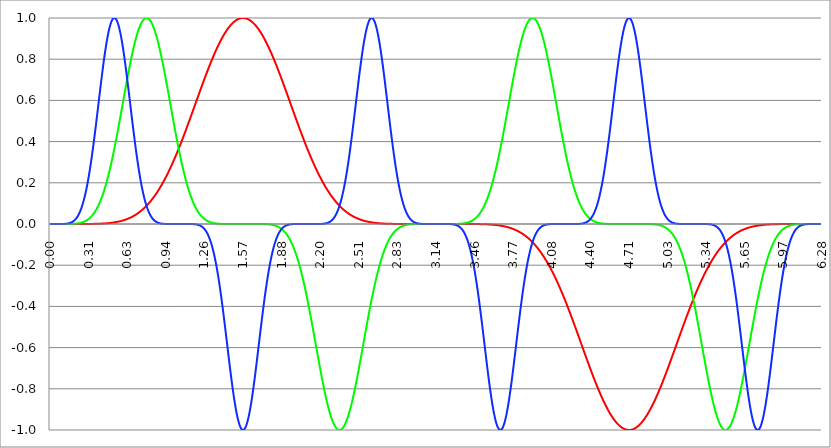
| Category | Series 1 | Series 0 | Series 2 |
|---|---|---|---|
| 0.0 | 0 | 0 | 0 |
| 0.00314159265358979 | 0 | 0 | 0 |
| 0.00628318530717958 | 0 | 0 | 0 |
| 0.00942477796076938 | 0 | 0 | 0 |
| 0.0125663706143592 | 0 | 0 | 0 |
| 0.015707963267949 | 0 | 0 | 0 |
| 0.0188495559215388 | 0 | 0 | 0 |
| 0.0219911485751285 | 0 | 0 | 0 |
| 0.0251327412287183 | 0 | 0 | 0 |
| 0.0282743338823081 | 0 | 0 | 0 |
| 0.0314159265358979 | 0 | 0 | 0 |
| 0.0345575191894877 | 0 | 0 | 0 |
| 0.0376991118430775 | 0 | 0 | 0 |
| 0.0408407044966673 | 0 | 0 | 0 |
| 0.0439822971502571 | 0 | 0 | 0 |
| 0.0471238898038469 | 0 | 0 | 0 |
| 0.0502654824574367 | 0 | 0 | 0 |
| 0.0534070751110265 | 0 | 0 | 0 |
| 0.0565486677646163 | 0 | 0 | 0 |
| 0.059690260418206 | 0 | 0 | 0 |
| 0.0628318530717958 | 0 | 0 | 0 |
| 0.0659734457253856 | 0 | 0 | 0 |
| 0.0691150383789754 | 0 | 0 | 0 |
| 0.0722566310325652 | 0 | 0 | 0 |
| 0.075398223686155 | 0 | 0 | 0 |
| 0.0785398163397448 | 0 | 0 | 0 |
| 0.0816814089933346 | 0 | 0 | 0 |
| 0.0848230016469244 | 0 | 0 | 0 |
| 0.0879645943005142 | 0 | 0 | 0 |
| 0.091106186954104 | 0 | 0 | 0 |
| 0.0942477796076937 | 0 | 0 | 0 |
| 0.0973893722612835 | 0 | 0 | 0 |
| 0.100530964914873 | 0 | 0 | 0 |
| 0.103672557568463 | 0 | 0 | 0 |
| 0.106814150222053 | 0 | 0 | 0 |
| 0.109955742875643 | 0 | 0 | 0 |
| 0.113097335529233 | 0 | 0 | 0 |
| 0.116238928182822 | 0 | 0 | 0.001 |
| 0.119380520836412 | 0 | 0 | 0.001 |
| 0.122522113490002 | 0 | 0 | 0.001 |
| 0.125663706143592 | 0 | 0 | 0.001 |
| 0.128805298797181 | 0 | 0 | 0.001 |
| 0.131946891450771 | 0 | 0 | 0.001 |
| 0.135088484104361 | 0 | 0 | 0.001 |
| 0.138230076757951 | 0 | 0 | 0.002 |
| 0.141371669411541 | 0 | 0 | 0.002 |
| 0.14451326206513 | 0 | 0 | 0.002 |
| 0.14765485471872 | 0 | 0 | 0.003 |
| 0.15079644737231 | 0 | 0 | 0.003 |
| 0.1539380400259 | 0 | 0 | 0.003 |
| 0.15707963267949 | 0 | 0 | 0.004 |
| 0.160221225333079 | 0 | 0 | 0.005 |
| 0.163362817986669 | 0 | 0 | 0.005 |
| 0.166504410640259 | 0 | 0 | 0.006 |
| 0.169646003293849 | 0 | 0 | 0.007 |
| 0.172787595947439 | 0 | 0.001 | 0.007 |
| 0.175929188601028 | 0 | 0.001 | 0.008 |
| 0.179070781254618 | 0 | 0.001 | 0.009 |
| 0.182212373908208 | 0 | 0.001 | 0.01 |
| 0.185353966561798 | 0 | 0.001 | 0.011 |
| 0.188495559215388 | 0 | 0.001 | 0.013 |
| 0.191637151868977 | 0 | 0.001 | 0.014 |
| 0.194778744522567 | 0 | 0.001 | 0.016 |
| 0.197920337176157 | 0 | 0.001 | 0.017 |
| 0.201061929829747 | 0 | 0.001 | 0.019 |
| 0.204203522483336 | 0 | 0.002 | 0.021 |
| 0.207345115136926 | 0 | 0.002 | 0.023 |
| 0.210486707790516 | 0 | 0.002 | 0.025 |
| 0.213628300444106 | 0 | 0.002 | 0.027 |
| 0.216769893097696 | 0 | 0.002 | 0.03 |
| 0.219911485751285 | 0 | 0.003 | 0.032 |
| 0.223053078404875 | 0 | 0.003 | 0.035 |
| 0.226194671058465 | 0 | 0.003 | 0.038 |
| 0.229336263712055 | 0 | 0.003 | 0.042 |
| 0.232477856365645 | 0 | 0.004 | 0.045 |
| 0.235619449019234 | 0 | 0.004 | 0.049 |
| 0.238761041672824 | 0 | 0.004 | 0.053 |
| 0.241902634326414 | 0 | 0.005 | 0.057 |
| 0.245044226980004 | 0 | 0.005 | 0.061 |
| 0.248185819633594 | 0 | 0.006 | 0.066 |
| 0.251327412287183 | 0 | 0.006 | 0.07 |
| 0.254469004940773 | 0 | 0.007 | 0.076 |
| 0.257610597594363 | 0 | 0.007 | 0.081 |
| 0.260752190247953 | 0 | 0.008 | 0.086 |
| 0.263893782901543 | 0 | 0.008 | 0.092 |
| 0.267035375555132 | 0 | 0.009 | 0.098 |
| 0.270176968208722 | 0 | 0.01 | 0.105 |
| 0.273318560862312 | 0 | 0.01 | 0.112 |
| 0.276460153515902 | 0 | 0.011 | 0.119 |
| 0.279601746169492 | 0 | 0.012 | 0.126 |
| 0.282743338823082 | 0 | 0.013 | 0.134 |
| 0.285884931476671 | 0 | 0.014 | 0.142 |
| 0.289026524130261 | 0 | 0.015 | 0.15 |
| 0.292168116783851 | 0 | 0.016 | 0.158 |
| 0.295309709437441 | 0 | 0.017 | 0.167 |
| 0.298451302091031 | 0 | 0.018 | 0.176 |
| 0.30159289474462 | 0 | 0.019 | 0.186 |
| 0.30473448739821 | 0 | 0.02 | 0.196 |
| 0.3078760800518 | 0 | 0.021 | 0.206 |
| 0.31101767270539 | 0 | 0.023 | 0.216 |
| 0.31415926535898 | 0 | 0.024 | 0.227 |
| 0.31730085801257 | 0 | 0.026 | 0.238 |
| 0.320442450666159 | 0 | 0.027 | 0.249 |
| 0.323584043319749 | 0 | 0.029 | 0.261 |
| 0.326725635973339 | 0 | 0.031 | 0.273 |
| 0.329867228626929 | 0 | 0.032 | 0.285 |
| 0.333008821280519 | 0 | 0.034 | 0.297 |
| 0.336150413934108 | 0 | 0.036 | 0.31 |
| 0.339292006587698 | 0 | 0.038 | 0.323 |
| 0.342433599241288 | 0 | 0.041 | 0.336 |
| 0.345575191894878 | 0.001 | 0.043 | 0.35 |
| 0.348716784548468 | 0.001 | 0.045 | 0.364 |
| 0.351858377202058 | 0.001 | 0.047 | 0.378 |
| 0.354999969855647 | 0.001 | 0.05 | 0.392 |
| 0.358141562509237 | 0.001 | 0.053 | 0.406 |
| 0.361283155162827 | 0.001 | 0.055 | 0.421 |
| 0.364424747816417 | 0.001 | 0.058 | 0.436 |
| 0.367566340470007 | 0.001 | 0.061 | 0.451 |
| 0.370707933123597 | 0.001 | 0.064 | 0.466 |
| 0.373849525777186 | 0.001 | 0.067 | 0.481 |
| 0.376991118430776 | 0.001 | 0.07 | 0.497 |
| 0.380132711084366 | 0.001 | 0.074 | 0.512 |
| 0.383274303737956 | 0.001 | 0.077 | 0.528 |
| 0.386415896391546 | 0.001 | 0.081 | 0.543 |
| 0.389557489045135 | 0.001 | 0.085 | 0.559 |
| 0.392699081698725 | 0.001 | 0.088 | 0.575 |
| 0.395840674352315 | 0.001 | 0.092 | 0.59 |
| 0.398982267005905 | 0.001 | 0.096 | 0.606 |
| 0.402123859659495 | 0.001 | 0.101 | 0.622 |
| 0.405265452313085 | 0.001 | 0.105 | 0.637 |
| 0.408407044966674 | 0.002 | 0.109 | 0.653 |
| 0.411548637620264 | 0.002 | 0.114 | 0.668 |
| 0.414690230273854 | 0.002 | 0.119 | 0.684 |
| 0.417831822927444 | 0.002 | 0.124 | 0.699 |
| 0.420973415581034 | 0.002 | 0.129 | 0.714 |
| 0.424115008234623 | 0.002 | 0.134 | 0.729 |
| 0.427256600888213 | 0.002 | 0.139 | 0.743 |
| 0.430398193541803 | 0.002 | 0.144 | 0.758 |
| 0.433539786195393 | 0.002 | 0.15 | 0.772 |
| 0.436681378848983 | 0.002 | 0.155 | 0.786 |
| 0.439822971502573 | 0.003 | 0.161 | 0.8 |
| 0.442964564156162 | 0.003 | 0.167 | 0.813 |
| 0.446106156809752 | 0.003 | 0.173 | 0.826 |
| 0.449247749463342 | 0.003 | 0.179 | 0.839 |
| 0.452389342116932 | 0.003 | 0.186 | 0.851 |
| 0.455530934770522 | 0.003 | 0.192 | 0.863 |
| 0.458672527424111 | 0.003 | 0.199 | 0.875 |
| 0.461814120077701 | 0.003 | 0.206 | 0.886 |
| 0.464955712731291 | 0.004 | 0.213 | 0.897 |
| 0.468097305384881 | 0.004 | 0.22 | 0.907 |
| 0.471238898038471 | 0.004 | 0.227 | 0.917 |
| 0.474380490692061 | 0.004 | 0.234 | 0.926 |
| 0.47752208334565 | 0.004 | 0.242 | 0.935 |
| 0.48066367599924 | 0.005 | 0.249 | 0.943 |
| 0.48380526865283 | 0.005 | 0.257 | 0.951 |
| 0.48694686130642 | 0.005 | 0.265 | 0.958 |
| 0.49008845396001 | 0.005 | 0.273 | 0.965 |
| 0.493230046613599 | 0.005 | 0.281 | 0.971 |
| 0.496371639267189 | 0.006 | 0.289 | 0.977 |
| 0.499513231920779 | 0.006 | 0.297 | 0.982 |
| 0.502654824574369 | 0.006 | 0.306 | 0.986 |
| 0.505796417227959 | 0.006 | 0.314 | 0.99 |
| 0.508938009881549 | 0.007 | 0.323 | 0.993 |
| 0.512079602535138 | 0.007 | 0.332 | 0.996 |
| 0.515221195188728 | 0.007 | 0.341 | 0.998 |
| 0.518362787842318 | 0.007 | 0.35 | 0.999 |
| 0.521504380495908 | 0.008 | 0.359 | 1 |
| 0.524645973149498 | 0.008 | 0.368 | 1 |
| 0.527787565803087 | 0.008 | 0.378 | 0.999 |
| 0.530929158456677 | 0.009 | 0.387 | 0.998 |
| 0.534070751110267 | 0.009 | 0.397 | 0.997 |
| 0.537212343763857 | 0.009 | 0.406 | 0.994 |
| 0.540353936417447 | 0.01 | 0.416 | 0.991 |
| 0.543495529071037 | 0.01 | 0.426 | 0.988 |
| 0.546637121724626 | 0.01 | 0.436 | 0.983 |
| 0.549778714378216 | 0.011 | 0.446 | 0.979 |
| 0.552920307031806 | 0.011 | 0.456 | 0.973 |
| 0.556061899685396 | 0.011 | 0.466 | 0.967 |
| 0.559203492338986 | 0.012 | 0.476 | 0.961 |
| 0.562345084992576 | 0.012 | 0.486 | 0.954 |
| 0.565486677646165 | 0.013 | 0.497 | 0.946 |
| 0.568628270299755 | 0.013 | 0.507 | 0.938 |
| 0.571769862953345 | 0.014 | 0.517 | 0.929 |
| 0.574911455606935 | 0.014 | 0.528 | 0.92 |
| 0.578053048260525 | 0.015 | 0.538 | 0.91 |
| 0.581194640914114 | 0.015 | 0.548 | 0.9 |
| 0.584336233567704 | 0.016 | 0.559 | 0.89 |
| 0.587477826221294 | 0.016 | 0.569 | 0.879 |
| 0.590619418874884 | 0.017 | 0.58 | 0.867 |
| 0.593761011528474 | 0.017 | 0.59 | 0.855 |
| 0.596902604182064 | 0.018 | 0.601 | 0.843 |
| 0.600044196835653 | 0.018 | 0.611 | 0.831 |
| 0.603185789489243 | 0.019 | 0.622 | 0.818 |
| 0.606327382142833 | 0.02 | 0.632 | 0.804 |
| 0.609468974796423 | 0.02 | 0.642 | 0.791 |
| 0.612610567450013 | 0.021 | 0.653 | 0.777 |
| 0.615752160103602 | 0.021 | 0.663 | 0.763 |
| 0.618893752757192 | 0.022 | 0.673 | 0.748 |
| 0.622035345410782 | 0.023 | 0.684 | 0.734 |
| 0.625176938064372 | 0.024 | 0.694 | 0.719 |
| 0.628318530717962 | 0.024 | 0.704 | 0.704 |
| 0.631460123371551 | 0.025 | 0.714 | 0.689 |
| 0.634601716025141 | 0.026 | 0.724 | 0.673 |
| 0.637743308678731 | 0.027 | 0.734 | 0.658 |
| 0.640884901332321 | 0.027 | 0.743 | 0.642 |
| 0.644026493985911 | 0.028 | 0.753 | 0.627 |
| 0.647168086639501 | 0.029 | 0.763 | 0.611 |
| 0.65030967929309 | 0.03 | 0.772 | 0.595 |
| 0.65345127194668 | 0.031 | 0.781 | 0.58 |
| 0.65659286460027 | 0.032 | 0.791 | 0.564 |
| 0.65973445725386 | 0.032 | 0.8 | 0.548 |
| 0.66287604990745 | 0.033 | 0.809 | 0.533 |
| 0.666017642561039 | 0.034 | 0.818 | 0.517 |
| 0.669159235214629 | 0.035 | 0.826 | 0.502 |
| 0.672300827868219 | 0.036 | 0.835 | 0.486 |
| 0.675442420521809 | 0.037 | 0.843 | 0.471 |
| 0.678584013175399 | 0.038 | 0.851 | 0.456 |
| 0.681725605828989 | 0.039 | 0.859 | 0.441 |
| 0.684867198482578 | 0.041 | 0.867 | 0.426 |
| 0.688008791136168 | 0.042 | 0.875 | 0.411 |
| 0.691150383789758 | 0.043 | 0.882 | 0.397 |
| 0.694291976443348 | 0.044 | 0.89 | 0.383 |
| 0.697433569096938 | 0.045 | 0.897 | 0.368 |
| 0.700575161750528 | 0.046 | 0.904 | 0.355 |
| 0.703716754404117 | 0.047 | 0.91 | 0.341 |
| 0.706858347057707 | 0.049 | 0.917 | 0.328 |
| 0.709999939711297 | 0.05 | 0.923 | 0.314 |
| 0.713141532364887 | 0.051 | 0.929 | 0.302 |
| 0.716283125018477 | 0.053 | 0.935 | 0.289 |
| 0.719424717672066 | 0.054 | 0.941 | 0.277 |
| 0.722566310325656 | 0.055 | 0.946 | 0.265 |
| 0.725707902979246 | 0.057 | 0.951 | 0.253 |
| 0.728849495632836 | 0.058 | 0.956 | 0.242 |
| 0.731991088286426 | 0.06 | 0.961 | 0.23 |
| 0.735132680940016 | 0.061 | 0.965 | 0.22 |
| 0.738274273593605 | 0.063 | 0.969 | 0.209 |
| 0.741415866247195 | 0.064 | 0.973 | 0.199 |
| 0.744557458900785 | 0.066 | 0.977 | 0.189 |
| 0.747699051554375 | 0.067 | 0.98 | 0.179 |
| 0.750840644207965 | 0.069 | 0.983 | 0.17 |
| 0.753982236861554 | 0.07 | 0.986 | 0.161 |
| 0.757123829515144 | 0.072 | 0.989 | 0.153 |
| 0.760265422168734 | 0.074 | 0.991 | 0.144 |
| 0.763407014822324 | 0.076 | 0.993 | 0.136 |
| 0.766548607475914 | 0.077 | 0.995 | 0.129 |
| 0.769690200129504 | 0.079 | 0.997 | 0.121 |
| 0.772831792783093 | 0.081 | 0.998 | 0.114 |
| 0.775973385436683 | 0.083 | 0.999 | 0.107 |
| 0.779114978090273 | 0.085 | 0.999 | 0.101 |
| 0.782256570743863 | 0.086 | 1 | 0.094 |
| 0.785398163397453 | 0.088 | 1 | 0.088 |
| 0.788539756051042 | 0.09 | 1 | 0.083 |
| 0.791681348704632 | 0.092 | 0.999 | 0.077 |
| 0.794822941358222 | 0.094 | 0.999 | 0.072 |
| 0.797964534011812 | 0.096 | 0.998 | 0.067 |
| 0.801106126665402 | 0.098 | 0.997 | 0.063 |
| 0.804247719318992 | 0.101 | 0.995 | 0.058 |
| 0.807389311972581 | 0.103 | 0.993 | 0.054 |
| 0.810530904626171 | 0.105 | 0.991 | 0.05 |
| 0.813672497279761 | 0.107 | 0.989 | 0.046 |
| 0.816814089933351 | 0.109 | 0.986 | 0.043 |
| 0.819955682586941 | 0.112 | 0.983 | 0.039 |
| 0.823097275240531 | 0.114 | 0.98 | 0.036 |
| 0.82623886789412 | 0.116 | 0.977 | 0.033 |
| 0.82938046054771 | 0.119 | 0.973 | 0.031 |
| 0.8325220532013 | 0.121 | 0.969 | 0.028 |
| 0.83566364585489 | 0.124 | 0.965 | 0.026 |
| 0.83880523850848 | 0.126 | 0.961 | 0.024 |
| 0.841946831162069 | 0.129 | 0.956 | 0.021 |
| 0.845088423815659 | 0.131 | 0.951 | 0.02 |
| 0.848230016469249 | 0.134 | 0.946 | 0.018 |
| 0.851371609122839 | 0.136 | 0.941 | 0.016 |
| 0.854513201776429 | 0.139 | 0.935 | 0.015 |
| 0.857654794430019 | 0.142 | 0.929 | 0.013 |
| 0.860796387083608 | 0.144 | 0.923 | 0.012 |
| 0.863937979737198 | 0.147 | 0.917 | 0.011 |
| 0.867079572390788 | 0.15 | 0.91 | 0.01 |
| 0.870221165044378 | 0.153 | 0.904 | 0.009 |
| 0.873362757697968 | 0.155 | 0.897 | 0.008 |
| 0.876504350351557 | 0.158 | 0.89 | 0.007 |
| 0.879645943005147 | 0.161 | 0.882 | 0.006 |
| 0.882787535658737 | 0.164 | 0.875 | 0.005 |
| 0.885929128312327 | 0.167 | 0.867 | 0.005 |
| 0.889070720965917 | 0.17 | 0.859 | 0.004 |
| 0.892212313619507 | 0.173 | 0.851 | 0.004 |
| 0.895353906273096 | 0.176 | 0.843 | 0.003 |
| 0.898495498926686 | 0.179 | 0.835 | 0.003 |
| 0.901637091580276 | 0.183 | 0.826 | 0.002 |
| 0.904778684233866 | 0.186 | 0.818 | 0.002 |
| 0.907920276887456 | 0.189 | 0.809 | 0.002 |
| 0.911061869541045 | 0.192 | 0.8 | 0.002 |
| 0.914203462194635 | 0.196 | 0.791 | 0.001 |
| 0.917345054848225 | 0.199 | 0.781 | 0.001 |
| 0.920486647501815 | 0.202 | 0.772 | 0.001 |
| 0.923628240155405 | 0.206 | 0.763 | 0.001 |
| 0.926769832808995 | 0.209 | 0.753 | 0.001 |
| 0.929911425462584 | 0.213 | 0.743 | 0.001 |
| 0.933053018116174 | 0.216 | 0.734 | 0 |
| 0.936194610769764 | 0.22 | 0.724 | 0 |
| 0.939336203423354 | 0.223 | 0.714 | 0 |
| 0.942477796076944 | 0.227 | 0.704 | 0 |
| 0.945619388730533 | 0.23 | 0.694 | 0 |
| 0.948760981384123 | 0.234 | 0.684 | 0 |
| 0.951902574037713 | 0.238 | 0.673 | 0 |
| 0.955044166691303 | 0.242 | 0.663 | 0 |
| 0.958185759344893 | 0.245 | 0.653 | 0 |
| 0.961327351998483 | 0.249 | 0.642 | 0 |
| 0.964468944652072 | 0.253 | 0.632 | 0 |
| 0.967610537305662 | 0.257 | 0.622 | 0 |
| 0.970752129959252 | 0.261 | 0.611 | 0 |
| 0.973893722612842 | 0.265 | 0.601 | 0 |
| 0.977035315266432 | 0.269 | 0.59 | 0 |
| 0.980176907920022 | 0.273 | 0.58 | 0 |
| 0.983318500573611 | 0.277 | 0.569 | 0 |
| 0.986460093227201 | 0.281 | 0.559 | 0 |
| 0.989601685880791 | 0.285 | 0.548 | 0 |
| 0.992743278534381 | 0.289 | 0.538 | 0 |
| 0.995884871187971 | 0.293 | 0.528 | 0 |
| 0.99902646384156 | 0.297 | 0.517 | 0 |
| 1.00216805649515 | 0.302 | 0.507 | 0 |
| 1.00530964914874 | 0.306 | 0.497 | 0 |
| 1.00845124180233 | 0.31 | 0.486 | 0 |
| 1.01159283445592 | 0.314 | 0.476 | 0 |
| 1.01473442710951 | 0.319 | 0.466 | 0 |
| 1.017876019763099 | 0.323 | 0.456 | 0 |
| 1.021017612416689 | 0.328 | 0.446 | 0 |
| 1.02415920507028 | 0.332 | 0.436 | 0 |
| 1.027300797723869 | 0.336 | 0.426 | 0 |
| 1.030442390377459 | 0.341 | 0.416 | 0 |
| 1.033583983031048 | 0.345 | 0.406 | 0 |
| 1.036725575684638 | 0.35 | 0.397 | 0 |
| 1.039867168338228 | 0.355 | 0.387 | 0 |
| 1.043008760991818 | 0.359 | 0.378 | 0 |
| 1.046150353645408 | 0.364 | 0.368 | 0 |
| 1.049291946298998 | 0.368 | 0.359 | 0 |
| 1.052433538952587 | 0.373 | 0.35 | 0 |
| 1.055575131606177 | 0.378 | 0.341 | 0 |
| 1.058716724259767 | 0.383 | 0.332 | 0 |
| 1.061858316913357 | 0.387 | 0.323 | 0 |
| 1.064999909566947 | 0.392 | 0.314 | 0 |
| 1.068141502220536 | 0.397 | 0.306 | 0 |
| 1.071283094874126 | 0.402 | 0.297 | 0 |
| 1.074424687527716 | 0.406 | 0.289 | 0 |
| 1.077566280181306 | 0.411 | 0.281 | 0 |
| 1.080707872834896 | 0.416 | 0.273 | 0 |
| 1.083849465488486 | 0.421 | 0.265 | 0 |
| 1.086991058142075 | 0.426 | 0.257 | 0 |
| 1.090132650795665 | 0.431 | 0.249 | 0 |
| 1.093274243449255 | 0.436 | 0.242 | 0 |
| 1.096415836102845 | 0.441 | 0.234 | 0 |
| 1.099557428756435 | 0.446 | 0.227 | 0 |
| 1.102699021410025 | 0.451 | 0.22 | 0 |
| 1.105840614063614 | 0.456 | 0.213 | 0 |
| 1.108982206717204 | 0.461 | 0.206 | 0 |
| 1.112123799370794 | 0.466 | 0.199 | 0 |
| 1.115265392024384 | 0.471 | 0.192 | 0 |
| 1.118406984677974 | 0.476 | 0.186 | 0 |
| 1.121548577331563 | 0.481 | 0.179 | 0 |
| 1.124690169985153 | 0.486 | 0.173 | 0 |
| 1.127831762638743 | 0.491 | 0.167 | 0 |
| 1.130973355292333 | 0.497 | 0.161 | 0 |
| 1.134114947945923 | 0.502 | 0.155 | 0 |
| 1.137256540599513 | 0.507 | 0.15 | 0 |
| 1.140398133253102 | 0.512 | 0.144 | 0 |
| 1.143539725906692 | 0.517 | 0.139 | 0 |
| 1.146681318560282 | 0.522 | 0.134 | 0 |
| 1.149822911213872 | 0.528 | 0.129 | 0 |
| 1.152964503867462 | 0.533 | 0.124 | 0 |
| 1.156106096521051 | 0.538 | 0.119 | 0 |
| 1.159247689174641 | 0.543 | 0.114 | 0 |
| 1.162389281828231 | 0.548 | 0.109 | -0.001 |
| 1.165530874481821 | 0.554 | 0.105 | -0.001 |
| 1.168672467135411 | 0.559 | 0.101 | -0.001 |
| 1.171814059789001 | 0.564 | 0.096 | -0.001 |
| 1.17495565244259 | 0.569 | 0.092 | -0.001 |
| 1.17809724509618 | 0.575 | 0.088 | -0.001 |
| 1.18123883774977 | 0.58 | 0.085 | -0.001 |
| 1.18438043040336 | 0.585 | 0.081 | -0.002 |
| 1.18752202305695 | 0.59 | 0.077 | -0.002 |
| 1.190663615710539 | 0.595 | 0.074 | -0.002 |
| 1.193805208364129 | 0.601 | 0.07 | -0.003 |
| 1.19694680101772 | 0.606 | 0.067 | -0.003 |
| 1.200088393671309 | 0.611 | 0.064 | -0.003 |
| 1.203229986324899 | 0.616 | 0.061 | -0.004 |
| 1.206371578978489 | 0.622 | 0.058 | -0.004 |
| 1.209513171632078 | 0.627 | 0.055 | -0.005 |
| 1.212654764285668 | 0.632 | 0.053 | -0.006 |
| 1.215796356939258 | 0.637 | 0.05 | -0.006 |
| 1.218937949592848 | 0.642 | 0.047 | -0.007 |
| 1.222079542246438 | 0.648 | 0.045 | -0.008 |
| 1.225221134900027 | 0.653 | 0.043 | -0.009 |
| 1.228362727553617 | 0.658 | 0.041 | -0.01 |
| 1.231504320207207 | 0.663 | 0.038 | -0.011 |
| 1.234645912860797 | 0.668 | 0.036 | -0.012 |
| 1.237787505514387 | 0.673 | 0.034 | -0.014 |
| 1.240929098167977 | 0.678 | 0.032 | -0.015 |
| 1.244070690821566 | 0.684 | 0.031 | -0.017 |
| 1.247212283475156 | 0.689 | 0.029 | -0.018 |
| 1.250353876128746 | 0.694 | 0.027 | -0.02 |
| 1.253495468782336 | 0.699 | 0.026 | -0.022 |
| 1.256637061435926 | 0.704 | 0.024 | -0.024 |
| 1.259778654089515 | 0.709 | 0.023 | -0.027 |
| 1.262920246743105 | 0.714 | 0.021 | -0.029 |
| 1.266061839396695 | 0.719 | 0.02 | -0.032 |
| 1.269203432050285 | 0.724 | 0.019 | -0.034 |
| 1.272345024703875 | 0.729 | 0.018 | -0.037 |
| 1.275486617357465 | 0.734 | 0.017 | -0.041 |
| 1.278628210011054 | 0.739 | 0.016 | -0.044 |
| 1.281769802664644 | 0.743 | 0.015 | -0.047 |
| 1.284911395318234 | 0.748 | 0.014 | -0.051 |
| 1.288052987971824 | 0.753 | 0.013 | -0.055 |
| 1.291194580625414 | 0.758 | 0.012 | -0.06 |
| 1.294336173279003 | 0.763 | 0.011 | -0.064 |
| 1.297477765932593 | 0.767 | 0.01 | -0.069 |
| 1.300619358586183 | 0.772 | 0.01 | -0.074 |
| 1.303760951239773 | 0.777 | 0.009 | -0.079 |
| 1.306902543893363 | 0.781 | 0.008 | -0.085 |
| 1.310044136546953 | 0.786 | 0.008 | -0.09 |
| 1.313185729200542 | 0.791 | 0.007 | -0.096 |
| 1.316327321854132 | 0.795 | 0.007 | -0.103 |
| 1.319468914507722 | 0.8 | 0.006 | -0.109 |
| 1.322610507161312 | 0.804 | 0.006 | -0.116 |
| 1.325752099814902 | 0.809 | 0.005 | -0.124 |
| 1.328893692468491 | 0.813 | 0.005 | -0.131 |
| 1.332035285122081 | 0.818 | 0.004 | -0.139 |
| 1.335176877775671 | 0.822 | 0.004 | -0.147 |
| 1.338318470429261 | 0.826 | 0.004 | -0.155 |
| 1.341460063082851 | 0.831 | 0.003 | -0.164 |
| 1.344601655736441 | 0.835 | 0.003 | -0.173 |
| 1.34774324839003 | 0.839 | 0.003 | -0.183 |
| 1.35088484104362 | 0.843 | 0.003 | -0.192 |
| 1.35402643369721 | 0.847 | 0.002 | -0.202 |
| 1.3571680263508 | 0.851 | 0.002 | -0.213 |
| 1.36030961900439 | 0.855 | 0.002 | -0.223 |
| 1.363451211657979 | 0.859 | 0.002 | -0.234 |
| 1.36659280431157 | 0.863 | 0.002 | -0.245 |
| 1.369734396965159 | 0.867 | 0.001 | -0.257 |
| 1.372875989618749 | 0.871 | 0.001 | -0.269 |
| 1.376017582272339 | 0.875 | 0.001 | -0.281 |
| 1.379159174925929 | 0.879 | 0.001 | -0.293 |
| 1.382300767579518 | 0.882 | 0.001 | -0.306 |
| 1.385442360233108 | 0.886 | 0.001 | -0.319 |
| 1.388583952886698 | 0.89 | 0.001 | -0.332 |
| 1.391725545540288 | 0.893 | 0.001 | -0.345 |
| 1.394867138193878 | 0.897 | 0.001 | -0.359 |
| 1.398008730847468 | 0.9 | 0.001 | -0.373 |
| 1.401150323501057 | 0.904 | 0 | -0.387 |
| 1.404291916154647 | 0.907 | 0 | -0.402 |
| 1.407433508808237 | 0.91 | 0 | -0.416 |
| 1.410575101461827 | 0.914 | 0 | -0.431 |
| 1.413716694115417 | 0.917 | 0 | -0.446 |
| 1.416858286769006 | 0.92 | 0 | -0.461 |
| 1.419999879422596 | 0.923 | 0 | -0.476 |
| 1.423141472076186 | 0.926 | 0 | -0.491 |
| 1.426283064729776 | 0.929 | 0 | -0.507 |
| 1.429424657383366 | 0.932 | 0 | -0.522 |
| 1.432566250036956 | 0.935 | 0 | -0.538 |
| 1.435707842690545 | 0.938 | 0 | -0.554 |
| 1.438849435344135 | 0.941 | 0 | -0.569 |
| 1.441991027997725 | 0.943 | 0 | -0.585 |
| 1.445132620651315 | 0.946 | 0 | -0.601 |
| 1.448274213304905 | 0.949 | 0 | -0.616 |
| 1.451415805958494 | 0.951 | 0 | -0.632 |
| 1.454557398612084 | 0.954 | 0 | -0.648 |
| 1.457698991265674 | 0.956 | 0 | -0.663 |
| 1.460840583919264 | 0.958 | 0 | -0.678 |
| 1.463982176572854 | 0.961 | 0 | -0.694 |
| 1.467123769226444 | 0.963 | 0 | -0.709 |
| 1.470265361880033 | 0.965 | 0 | -0.724 |
| 1.473406954533623 | 0.967 | 0 | -0.739 |
| 1.476548547187213 | 0.969 | 0 | -0.753 |
| 1.479690139840803 | 0.971 | 0 | -0.767 |
| 1.482831732494393 | 0.973 | 0 | -0.781 |
| 1.485973325147982 | 0.975 | 0 | -0.795 |
| 1.489114917801572 | 0.977 | 0 | -0.809 |
| 1.492256510455162 | 0.979 | 0 | -0.822 |
| 1.495398103108752 | 0.98 | 0 | -0.835 |
| 1.498539695762342 | 0.982 | 0 | -0.847 |
| 1.501681288415932 | 0.983 | 0 | -0.859 |
| 1.504822881069521 | 0.985 | 0 | -0.871 |
| 1.507964473723111 | 0.986 | 0 | -0.882 |
| 1.511106066376701 | 0.988 | 0 | -0.893 |
| 1.514247659030291 | 0.989 | 0 | -0.904 |
| 1.517389251683881 | 0.99 | 0 | -0.914 |
| 1.520530844337471 | 0.991 | 0 | -0.923 |
| 1.52367243699106 | 0.992 | 0 | -0.932 |
| 1.52681402964465 | 0.993 | 0 | -0.941 |
| 1.52995562229824 | 0.994 | 0 | -0.949 |
| 1.53309721495183 | 0.995 | 0 | -0.956 |
| 1.53623880760542 | 0.996 | 0 | -0.963 |
| 1.539380400259009 | 0.997 | 0 | -0.969 |
| 1.542521992912599 | 0.997 | 0 | -0.975 |
| 1.545663585566189 | 0.998 | 0 | -0.98 |
| 1.548805178219779 | 0.998 | 0 | -0.985 |
| 1.551946770873369 | 0.999 | 0 | -0.989 |
| 1.555088363526959 | 0.999 | 0 | -0.992 |
| 1.558229956180548 | 0.999 | 0 | -0.995 |
| 1.561371548834138 | 1 | 0 | -0.997 |
| 1.564513141487728 | 1 | 0 | -0.999 |
| 1.567654734141318 | 1 | 0 | -1 |
| 1.570796326794908 | 1 | 0 | -1 |
| 1.573937919448497 | 1 | 0 | -1 |
| 1.577079512102087 | 1 | 0 | -0.999 |
| 1.580221104755677 | 1 | 0 | -0.997 |
| 1.583362697409267 | 0.999 | 0 | -0.995 |
| 1.586504290062857 | 0.999 | 0 | -0.992 |
| 1.589645882716447 | 0.999 | 0 | -0.989 |
| 1.592787475370036 | 0.998 | 0 | -0.985 |
| 1.595929068023626 | 0.998 | 0 | -0.98 |
| 1.599070660677216 | 0.997 | 0 | -0.975 |
| 1.602212253330806 | 0.997 | 0 | -0.969 |
| 1.605353845984396 | 0.996 | 0 | -0.963 |
| 1.608495438637985 | 0.995 | 0 | -0.956 |
| 1.611637031291575 | 0.994 | 0 | -0.949 |
| 1.614778623945165 | 0.993 | 0 | -0.941 |
| 1.617920216598755 | 0.992 | 0 | -0.932 |
| 1.621061809252345 | 0.991 | 0 | -0.923 |
| 1.624203401905935 | 0.99 | 0 | -0.914 |
| 1.627344994559524 | 0.989 | 0 | -0.904 |
| 1.630486587213114 | 0.988 | 0 | -0.893 |
| 1.633628179866704 | 0.986 | 0 | -0.882 |
| 1.636769772520294 | 0.985 | 0 | -0.871 |
| 1.639911365173884 | 0.983 | 0 | -0.859 |
| 1.643052957827473 | 0.982 | 0 | -0.847 |
| 1.646194550481063 | 0.98 | 0 | -0.835 |
| 1.649336143134653 | 0.979 | 0 | -0.822 |
| 1.652477735788243 | 0.977 | 0 | -0.809 |
| 1.655619328441833 | 0.975 | 0 | -0.795 |
| 1.658760921095423 | 0.973 | 0 | -0.781 |
| 1.661902513749012 | 0.971 | 0 | -0.767 |
| 1.665044106402602 | 0.969 | 0 | -0.753 |
| 1.668185699056192 | 0.967 | 0 | -0.739 |
| 1.671327291709782 | 0.965 | 0 | -0.724 |
| 1.674468884363372 | 0.963 | 0 | -0.709 |
| 1.677610477016961 | 0.961 | 0 | -0.694 |
| 1.680752069670551 | 0.958 | 0 | -0.678 |
| 1.683893662324141 | 0.956 | 0 | -0.663 |
| 1.687035254977731 | 0.954 | 0 | -0.648 |
| 1.690176847631321 | 0.951 | 0 | -0.632 |
| 1.693318440284911 | 0.949 | 0 | -0.616 |
| 1.6964600329385 | 0.946 | 0 | -0.601 |
| 1.69960162559209 | 0.943 | 0 | -0.585 |
| 1.70274321824568 | 0.941 | 0 | -0.569 |
| 1.70588481089927 | 0.938 | 0 | -0.554 |
| 1.70902640355286 | 0.935 | 0 | -0.538 |
| 1.712167996206449 | 0.932 | 0 | -0.522 |
| 1.715309588860039 | 0.929 | 0 | -0.507 |
| 1.71845118151363 | 0.926 | 0 | -0.491 |
| 1.721592774167219 | 0.923 | 0 | -0.476 |
| 1.724734366820809 | 0.92 | 0 | -0.461 |
| 1.727875959474399 | 0.917 | 0 | -0.446 |
| 1.731017552127988 | 0.914 | 0 | -0.431 |
| 1.734159144781578 | 0.91 | 0 | -0.416 |
| 1.737300737435168 | 0.907 | 0 | -0.402 |
| 1.740442330088758 | 0.904 | 0 | -0.387 |
| 1.743583922742348 | 0.9 | -0.001 | -0.373 |
| 1.746725515395937 | 0.897 | -0.001 | -0.359 |
| 1.749867108049527 | 0.893 | -0.001 | -0.345 |
| 1.753008700703117 | 0.89 | -0.001 | -0.332 |
| 1.756150293356707 | 0.886 | -0.001 | -0.319 |
| 1.759291886010297 | 0.882 | -0.001 | -0.306 |
| 1.762433478663887 | 0.879 | -0.001 | -0.293 |
| 1.765575071317476 | 0.875 | -0.001 | -0.281 |
| 1.768716663971066 | 0.871 | -0.001 | -0.269 |
| 1.771858256624656 | 0.867 | -0.001 | -0.257 |
| 1.774999849278246 | 0.863 | -0.002 | -0.245 |
| 1.778141441931836 | 0.859 | -0.002 | -0.234 |
| 1.781283034585426 | 0.855 | -0.002 | -0.223 |
| 1.784424627239015 | 0.851 | -0.002 | -0.213 |
| 1.787566219892605 | 0.847 | -0.002 | -0.202 |
| 1.790707812546195 | 0.843 | -0.003 | -0.192 |
| 1.793849405199785 | 0.839 | -0.003 | -0.183 |
| 1.796990997853375 | 0.835 | -0.003 | -0.173 |
| 1.800132590506964 | 0.831 | -0.003 | -0.164 |
| 1.803274183160554 | 0.826 | -0.004 | -0.155 |
| 1.806415775814144 | 0.822 | -0.004 | -0.147 |
| 1.809557368467734 | 0.818 | -0.004 | -0.139 |
| 1.812698961121324 | 0.813 | -0.005 | -0.131 |
| 1.815840553774914 | 0.809 | -0.005 | -0.124 |
| 1.818982146428503 | 0.804 | -0.006 | -0.116 |
| 1.822123739082093 | 0.8 | -0.006 | -0.109 |
| 1.825265331735683 | 0.795 | -0.007 | -0.103 |
| 1.828406924389273 | 0.791 | -0.007 | -0.096 |
| 1.831548517042863 | 0.786 | -0.008 | -0.09 |
| 1.834690109696452 | 0.781 | -0.008 | -0.085 |
| 1.837831702350042 | 0.777 | -0.009 | -0.079 |
| 1.840973295003632 | 0.772 | -0.01 | -0.074 |
| 1.844114887657222 | 0.767 | -0.01 | -0.069 |
| 1.847256480310812 | 0.763 | -0.011 | -0.064 |
| 1.850398072964402 | 0.758 | -0.012 | -0.06 |
| 1.853539665617991 | 0.753 | -0.013 | -0.055 |
| 1.856681258271581 | 0.748 | -0.014 | -0.051 |
| 1.859822850925171 | 0.743 | -0.015 | -0.047 |
| 1.862964443578761 | 0.739 | -0.016 | -0.044 |
| 1.866106036232351 | 0.734 | -0.017 | -0.041 |
| 1.86924762888594 | 0.729 | -0.018 | -0.037 |
| 1.87238922153953 | 0.724 | -0.019 | -0.034 |
| 1.87553081419312 | 0.719 | -0.02 | -0.032 |
| 1.87867240684671 | 0.714 | -0.021 | -0.029 |
| 1.8818139995003 | 0.709 | -0.023 | -0.027 |
| 1.88495559215389 | 0.704 | -0.024 | -0.024 |
| 1.888097184807479 | 0.699 | -0.026 | -0.022 |
| 1.891238777461069 | 0.694 | -0.027 | -0.02 |
| 1.89438037011466 | 0.689 | -0.029 | -0.018 |
| 1.897521962768249 | 0.684 | -0.031 | -0.017 |
| 1.900663555421839 | 0.678 | -0.032 | -0.015 |
| 1.903805148075429 | 0.673 | -0.034 | -0.014 |
| 1.906946740729018 | 0.668 | -0.036 | -0.012 |
| 1.910088333382608 | 0.663 | -0.038 | -0.011 |
| 1.913229926036198 | 0.658 | -0.041 | -0.01 |
| 1.916371518689788 | 0.653 | -0.043 | -0.009 |
| 1.919513111343378 | 0.648 | -0.045 | -0.008 |
| 1.922654703996967 | 0.642 | -0.047 | -0.007 |
| 1.925796296650557 | 0.637 | -0.05 | -0.006 |
| 1.928937889304147 | 0.632 | -0.053 | -0.006 |
| 1.932079481957737 | 0.627 | -0.055 | -0.005 |
| 1.935221074611327 | 0.622 | -0.058 | -0.004 |
| 1.938362667264917 | 0.616 | -0.061 | -0.004 |
| 1.941504259918506 | 0.611 | -0.064 | -0.003 |
| 1.944645852572096 | 0.606 | -0.067 | -0.003 |
| 1.947787445225686 | 0.601 | -0.07 | -0.003 |
| 1.950929037879276 | 0.595 | -0.074 | -0.002 |
| 1.954070630532866 | 0.59 | -0.077 | -0.002 |
| 1.957212223186455 | 0.585 | -0.081 | -0.002 |
| 1.960353815840045 | 0.58 | -0.085 | -0.001 |
| 1.963495408493635 | 0.575 | -0.088 | -0.001 |
| 1.966637001147225 | 0.569 | -0.092 | -0.001 |
| 1.969778593800815 | 0.564 | -0.096 | -0.001 |
| 1.972920186454405 | 0.559 | -0.101 | -0.001 |
| 1.976061779107994 | 0.554 | -0.105 | -0.001 |
| 1.979203371761584 | 0.548 | -0.109 | -0.001 |
| 1.982344964415174 | 0.543 | -0.114 | 0 |
| 1.985486557068764 | 0.538 | -0.119 | 0 |
| 1.988628149722354 | 0.533 | -0.124 | 0 |
| 1.991769742375943 | 0.528 | -0.129 | 0 |
| 1.994911335029533 | 0.522 | -0.134 | 0 |
| 1.998052927683123 | 0.517 | -0.139 | 0 |
| 2.001194520336712 | 0.512 | -0.144 | 0 |
| 2.004336112990302 | 0.507 | -0.15 | 0 |
| 2.007477705643892 | 0.502 | -0.155 | 0 |
| 2.010619298297482 | 0.497 | -0.161 | 0 |
| 2.013760890951071 | 0.491 | -0.167 | 0 |
| 2.016902483604661 | 0.486 | -0.173 | 0 |
| 2.02004407625825 | 0.481 | -0.179 | 0 |
| 2.02318566891184 | 0.476 | -0.186 | 0 |
| 2.02632726156543 | 0.471 | -0.192 | 0 |
| 2.029468854219019 | 0.466 | -0.199 | 0 |
| 2.032610446872609 | 0.461 | -0.206 | 0 |
| 2.035752039526198 | 0.456 | -0.213 | 0 |
| 2.038893632179788 | 0.451 | -0.22 | 0 |
| 2.042035224833378 | 0.446 | -0.227 | 0 |
| 2.045176817486967 | 0.441 | -0.234 | 0 |
| 2.048318410140557 | 0.436 | -0.242 | 0 |
| 2.051460002794146 | 0.431 | -0.249 | 0 |
| 2.054601595447736 | 0.426 | -0.257 | 0 |
| 2.057743188101325 | 0.421 | -0.265 | 0 |
| 2.060884780754915 | 0.416 | -0.273 | 0 |
| 2.064026373408505 | 0.411 | -0.281 | 0 |
| 2.067167966062094 | 0.406 | -0.289 | 0 |
| 2.070309558715684 | 0.402 | -0.297 | 0 |
| 2.073451151369273 | 0.397 | -0.306 | 0 |
| 2.076592744022863 | 0.392 | -0.314 | 0 |
| 2.079734336676452 | 0.387 | -0.323 | 0 |
| 2.082875929330042 | 0.383 | -0.332 | 0 |
| 2.086017521983632 | 0.378 | -0.341 | 0 |
| 2.089159114637221 | 0.373 | -0.35 | 0 |
| 2.092300707290811 | 0.368 | -0.359 | 0 |
| 2.095442299944401 | 0.364 | -0.368 | 0 |
| 2.09858389259799 | 0.359 | -0.378 | 0 |
| 2.10172548525158 | 0.355 | -0.387 | 0 |
| 2.104867077905169 | 0.35 | -0.397 | 0 |
| 2.108008670558759 | 0.345 | -0.406 | 0 |
| 2.111150263212349 | 0.341 | -0.416 | 0 |
| 2.114291855865938 | 0.336 | -0.426 | 0 |
| 2.117433448519528 | 0.332 | -0.436 | 0 |
| 2.120575041173117 | 0.328 | -0.446 | 0 |
| 2.123716633826707 | 0.323 | -0.456 | 0 |
| 2.126858226480297 | 0.319 | -0.466 | 0 |
| 2.129999819133886 | 0.314 | -0.476 | 0 |
| 2.133141411787476 | 0.31 | -0.486 | 0 |
| 2.136283004441065 | 0.306 | -0.497 | 0 |
| 2.139424597094655 | 0.302 | -0.507 | 0 |
| 2.142566189748245 | 0.297 | -0.517 | 0 |
| 2.145707782401834 | 0.293 | -0.528 | 0 |
| 2.148849375055424 | 0.289 | -0.538 | 0 |
| 2.151990967709013 | 0.285 | -0.548 | 0 |
| 2.155132560362603 | 0.281 | -0.559 | 0 |
| 2.158274153016193 | 0.277 | -0.569 | 0 |
| 2.161415745669782 | 0.273 | -0.58 | 0 |
| 2.164557338323372 | 0.269 | -0.59 | 0 |
| 2.167698930976961 | 0.265 | -0.601 | 0 |
| 2.170840523630551 | 0.261 | -0.611 | 0 |
| 2.173982116284141 | 0.257 | -0.622 | 0 |
| 2.17712370893773 | 0.253 | -0.632 | 0 |
| 2.18026530159132 | 0.249 | -0.642 | 0 |
| 2.183406894244909 | 0.245 | -0.653 | 0 |
| 2.186548486898499 | 0.242 | -0.663 | 0 |
| 2.189690079552089 | 0.238 | -0.673 | 0 |
| 2.192831672205678 | 0.234 | -0.684 | 0 |
| 2.195973264859268 | 0.23 | -0.694 | 0 |
| 2.199114857512857 | 0.227 | -0.704 | 0 |
| 2.202256450166447 | 0.223 | -0.714 | 0 |
| 2.205398042820036 | 0.22 | -0.724 | 0 |
| 2.208539635473626 | 0.216 | -0.734 | 0 |
| 2.211681228127216 | 0.213 | -0.743 | 0.001 |
| 2.214822820780805 | 0.209 | -0.753 | 0.001 |
| 2.217964413434395 | 0.206 | -0.763 | 0.001 |
| 2.221106006087984 | 0.202 | -0.772 | 0.001 |
| 2.224247598741574 | 0.199 | -0.781 | 0.001 |
| 2.227389191395164 | 0.196 | -0.791 | 0.001 |
| 2.230530784048753 | 0.192 | -0.8 | 0.002 |
| 2.233672376702343 | 0.189 | -0.809 | 0.002 |
| 2.236813969355933 | 0.186 | -0.818 | 0.002 |
| 2.239955562009522 | 0.183 | -0.826 | 0.002 |
| 2.243097154663112 | 0.179 | -0.835 | 0.003 |
| 2.246238747316701 | 0.176 | -0.843 | 0.003 |
| 2.249380339970291 | 0.173 | -0.851 | 0.004 |
| 2.252521932623881 | 0.17 | -0.859 | 0.004 |
| 2.25566352527747 | 0.167 | -0.867 | 0.005 |
| 2.25880511793106 | 0.164 | -0.875 | 0.005 |
| 2.261946710584649 | 0.161 | -0.882 | 0.006 |
| 2.265088303238239 | 0.158 | -0.89 | 0.007 |
| 2.268229895891829 | 0.155 | -0.897 | 0.008 |
| 2.271371488545418 | 0.153 | -0.904 | 0.009 |
| 2.274513081199008 | 0.15 | -0.91 | 0.01 |
| 2.277654673852597 | 0.147 | -0.917 | 0.011 |
| 2.280796266506186 | 0.144 | -0.923 | 0.012 |
| 2.283937859159776 | 0.142 | -0.929 | 0.013 |
| 2.287079451813366 | 0.139 | -0.935 | 0.015 |
| 2.290221044466955 | 0.136 | -0.941 | 0.016 |
| 2.293362637120545 | 0.134 | -0.946 | 0.018 |
| 2.296504229774135 | 0.131 | -0.951 | 0.02 |
| 2.299645822427724 | 0.129 | -0.956 | 0.021 |
| 2.302787415081314 | 0.126 | -0.961 | 0.024 |
| 2.305929007734904 | 0.124 | -0.965 | 0.026 |
| 2.309070600388493 | 0.121 | -0.969 | 0.028 |
| 2.312212193042083 | 0.119 | -0.973 | 0.031 |
| 2.315353785695672 | 0.116 | -0.977 | 0.033 |
| 2.318495378349262 | 0.114 | -0.98 | 0.036 |
| 2.321636971002852 | 0.112 | -0.983 | 0.039 |
| 2.324778563656441 | 0.109 | -0.986 | 0.043 |
| 2.327920156310031 | 0.107 | -0.989 | 0.046 |
| 2.33106174896362 | 0.105 | -0.991 | 0.05 |
| 2.33420334161721 | 0.103 | -0.993 | 0.054 |
| 2.3373449342708 | 0.101 | -0.995 | 0.058 |
| 2.340486526924389 | 0.098 | -0.997 | 0.063 |
| 2.343628119577979 | 0.096 | -0.998 | 0.067 |
| 2.346769712231568 | 0.094 | -0.999 | 0.072 |
| 2.349911304885158 | 0.092 | -0.999 | 0.077 |
| 2.353052897538748 | 0.09 | -1 | 0.083 |
| 2.356194490192337 | 0.088 | -1 | 0.088 |
| 2.359336082845927 | 0.086 | -1 | 0.094 |
| 2.362477675499516 | 0.085 | -0.999 | 0.101 |
| 2.365619268153106 | 0.083 | -0.999 | 0.107 |
| 2.368760860806696 | 0.081 | -0.998 | 0.114 |
| 2.371902453460285 | 0.079 | -0.997 | 0.121 |
| 2.375044046113875 | 0.077 | -0.995 | 0.129 |
| 2.378185638767464 | 0.076 | -0.993 | 0.136 |
| 2.381327231421054 | 0.074 | -0.991 | 0.144 |
| 2.384468824074644 | 0.072 | -0.989 | 0.153 |
| 2.387610416728233 | 0.07 | -0.986 | 0.161 |
| 2.390752009381823 | 0.069 | -0.983 | 0.17 |
| 2.393893602035412 | 0.067 | -0.98 | 0.179 |
| 2.397035194689002 | 0.066 | -0.977 | 0.189 |
| 2.400176787342591 | 0.064 | -0.973 | 0.199 |
| 2.403318379996181 | 0.063 | -0.969 | 0.209 |
| 2.406459972649771 | 0.061 | -0.965 | 0.22 |
| 2.40960156530336 | 0.06 | -0.961 | 0.23 |
| 2.41274315795695 | 0.058 | -0.956 | 0.242 |
| 2.41588475061054 | 0.057 | -0.951 | 0.253 |
| 2.419026343264129 | 0.055 | -0.946 | 0.265 |
| 2.422167935917719 | 0.054 | -0.941 | 0.277 |
| 2.425309528571308 | 0.053 | -0.935 | 0.289 |
| 2.428451121224898 | 0.051 | -0.929 | 0.302 |
| 2.431592713878488 | 0.05 | -0.923 | 0.314 |
| 2.434734306532077 | 0.049 | -0.917 | 0.328 |
| 2.437875899185667 | 0.047 | -0.91 | 0.341 |
| 2.441017491839256 | 0.046 | -0.904 | 0.355 |
| 2.444159084492846 | 0.045 | -0.897 | 0.368 |
| 2.447300677146435 | 0.044 | -0.89 | 0.383 |
| 2.450442269800025 | 0.043 | -0.882 | 0.397 |
| 2.453583862453615 | 0.042 | -0.875 | 0.411 |
| 2.456725455107204 | 0.041 | -0.867 | 0.426 |
| 2.459867047760794 | 0.039 | -0.859 | 0.441 |
| 2.463008640414384 | 0.038 | -0.851 | 0.456 |
| 2.466150233067973 | 0.037 | -0.843 | 0.471 |
| 2.469291825721563 | 0.036 | -0.835 | 0.486 |
| 2.472433418375152 | 0.035 | -0.826 | 0.502 |
| 2.475575011028742 | 0.034 | -0.818 | 0.517 |
| 2.478716603682332 | 0.033 | -0.809 | 0.533 |
| 2.481858196335921 | 0.032 | -0.8 | 0.548 |
| 2.48499978898951 | 0.032 | -0.791 | 0.564 |
| 2.4881413816431 | 0.031 | -0.781 | 0.58 |
| 2.49128297429669 | 0.03 | -0.772 | 0.595 |
| 2.49442456695028 | 0.029 | -0.763 | 0.611 |
| 2.497566159603869 | 0.028 | -0.753 | 0.627 |
| 2.500707752257458 | 0.027 | -0.743 | 0.642 |
| 2.503849344911048 | 0.027 | -0.734 | 0.658 |
| 2.506990937564638 | 0.026 | -0.724 | 0.673 |
| 2.510132530218228 | 0.025 | -0.714 | 0.689 |
| 2.513274122871817 | 0.024 | -0.704 | 0.704 |
| 2.516415715525407 | 0.024 | -0.694 | 0.719 |
| 2.519557308178996 | 0.023 | -0.684 | 0.734 |
| 2.522698900832586 | 0.022 | -0.673 | 0.748 |
| 2.525840493486176 | 0.021 | -0.663 | 0.763 |
| 2.528982086139765 | 0.021 | -0.653 | 0.777 |
| 2.532123678793355 | 0.02 | -0.642 | 0.791 |
| 2.535265271446944 | 0.02 | -0.632 | 0.804 |
| 2.538406864100534 | 0.019 | -0.622 | 0.818 |
| 2.541548456754124 | 0.018 | -0.611 | 0.831 |
| 2.544690049407713 | 0.018 | -0.601 | 0.843 |
| 2.547831642061302 | 0.017 | -0.59 | 0.855 |
| 2.550973234714892 | 0.017 | -0.58 | 0.867 |
| 2.554114827368482 | 0.016 | -0.569 | 0.879 |
| 2.557256420022072 | 0.016 | -0.559 | 0.89 |
| 2.560398012675661 | 0.015 | -0.548 | 0.9 |
| 2.563539605329251 | 0.015 | -0.538 | 0.91 |
| 2.56668119798284 | 0.014 | -0.528 | 0.92 |
| 2.56982279063643 | 0.014 | -0.517 | 0.929 |
| 2.57296438329002 | 0.013 | -0.507 | 0.938 |
| 2.576105975943609 | 0.013 | -0.497 | 0.946 |
| 2.579247568597199 | 0.012 | -0.486 | 0.954 |
| 2.582389161250788 | 0.012 | -0.476 | 0.961 |
| 2.585530753904377 | 0.011 | -0.466 | 0.967 |
| 2.588672346557967 | 0.011 | -0.456 | 0.973 |
| 2.591813939211557 | 0.011 | -0.446 | 0.979 |
| 2.594955531865147 | 0.01 | -0.436 | 0.983 |
| 2.598097124518736 | 0.01 | -0.426 | 0.988 |
| 2.601238717172326 | 0.01 | -0.416 | 0.991 |
| 2.604380309825915 | 0.009 | -0.406 | 0.994 |
| 2.607521902479505 | 0.009 | -0.397 | 0.997 |
| 2.610663495133095 | 0.009 | -0.387 | 0.998 |
| 2.613805087786684 | 0.008 | -0.378 | 0.999 |
| 2.616946680440274 | 0.008 | -0.368 | 1 |
| 2.620088273093863 | 0.008 | -0.359 | 1 |
| 2.623229865747452 | 0.007 | -0.35 | 0.999 |
| 2.626371458401042 | 0.007 | -0.341 | 0.998 |
| 2.629513051054632 | 0.007 | -0.332 | 0.996 |
| 2.632654643708222 | 0.007 | -0.323 | 0.993 |
| 2.635796236361811 | 0.006 | -0.314 | 0.99 |
| 2.638937829015401 | 0.006 | -0.306 | 0.986 |
| 2.642079421668991 | 0.006 | -0.297 | 0.982 |
| 2.64522101432258 | 0.006 | -0.289 | 0.977 |
| 2.64836260697617 | 0.005 | -0.281 | 0.971 |
| 2.651504199629759 | 0.005 | -0.273 | 0.965 |
| 2.654645792283349 | 0.005 | -0.265 | 0.958 |
| 2.657787384936938 | 0.005 | -0.257 | 0.951 |
| 2.660928977590528 | 0.005 | -0.249 | 0.943 |
| 2.664070570244118 | 0.004 | -0.242 | 0.935 |
| 2.667212162897707 | 0.004 | -0.234 | 0.926 |
| 2.670353755551297 | 0.004 | -0.227 | 0.917 |
| 2.673495348204887 | 0.004 | -0.22 | 0.907 |
| 2.676636940858476 | 0.004 | -0.213 | 0.897 |
| 2.679778533512066 | 0.003 | -0.206 | 0.886 |
| 2.682920126165655 | 0.003 | -0.199 | 0.875 |
| 2.686061718819245 | 0.003 | -0.192 | 0.863 |
| 2.689203311472835 | 0.003 | -0.186 | 0.851 |
| 2.692344904126424 | 0.003 | -0.179 | 0.839 |
| 2.695486496780014 | 0.003 | -0.173 | 0.826 |
| 2.698628089433603 | 0.003 | -0.167 | 0.813 |
| 2.701769682087193 | 0.003 | -0.161 | 0.8 |
| 2.704911274740782 | 0.002 | -0.155 | 0.786 |
| 2.708052867394372 | 0.002 | -0.15 | 0.772 |
| 2.711194460047962 | 0.002 | -0.144 | 0.758 |
| 2.714336052701551 | 0.002 | -0.139 | 0.743 |
| 2.717477645355141 | 0.002 | -0.134 | 0.729 |
| 2.720619238008731 | 0.002 | -0.129 | 0.714 |
| 2.72376083066232 | 0.002 | -0.124 | 0.699 |
| 2.72690242331591 | 0.002 | -0.119 | 0.684 |
| 2.730044015969499 | 0.002 | -0.114 | 0.668 |
| 2.733185608623089 | 0.002 | -0.109 | 0.653 |
| 2.736327201276678 | 0.001 | -0.105 | 0.637 |
| 2.739468793930268 | 0.001 | -0.101 | 0.622 |
| 2.742610386583858 | 0.001 | -0.096 | 0.606 |
| 2.745751979237447 | 0.001 | -0.092 | 0.59 |
| 2.748893571891036 | 0.001 | -0.088 | 0.575 |
| 2.752035164544627 | 0.001 | -0.085 | 0.559 |
| 2.755176757198216 | 0.001 | -0.081 | 0.543 |
| 2.758318349851806 | 0.001 | -0.077 | 0.528 |
| 2.761459942505395 | 0.001 | -0.074 | 0.512 |
| 2.764601535158985 | 0.001 | -0.07 | 0.497 |
| 2.767743127812574 | 0.001 | -0.067 | 0.481 |
| 2.770884720466164 | 0.001 | -0.064 | 0.466 |
| 2.774026313119754 | 0.001 | -0.061 | 0.451 |
| 2.777167905773343 | 0.001 | -0.058 | 0.436 |
| 2.780309498426932 | 0.001 | -0.055 | 0.421 |
| 2.783451091080522 | 0.001 | -0.053 | 0.406 |
| 2.786592683734112 | 0.001 | -0.05 | 0.392 |
| 2.789734276387701 | 0.001 | -0.047 | 0.378 |
| 2.792875869041291 | 0.001 | -0.045 | 0.364 |
| 2.796017461694881 | 0.001 | -0.043 | 0.35 |
| 2.79915905434847 | 0 | -0.041 | 0.336 |
| 2.80230064700206 | 0 | -0.038 | 0.323 |
| 2.80544223965565 | 0 | -0.036 | 0.31 |
| 2.808583832309239 | 0 | -0.034 | 0.297 |
| 2.811725424962829 | 0 | -0.032 | 0.285 |
| 2.814867017616419 | 0 | -0.031 | 0.273 |
| 2.818008610270008 | 0 | -0.029 | 0.261 |
| 2.821150202923598 | 0 | -0.027 | 0.249 |
| 2.824291795577187 | 0 | -0.026 | 0.238 |
| 2.827433388230777 | 0 | -0.024 | 0.227 |
| 2.830574980884366 | 0 | -0.023 | 0.216 |
| 2.833716573537956 | 0 | -0.021 | 0.206 |
| 2.836858166191546 | 0 | -0.02 | 0.196 |
| 2.839999758845135 | 0 | -0.019 | 0.186 |
| 2.843141351498725 | 0 | -0.018 | 0.176 |
| 2.846282944152314 | 0 | -0.017 | 0.167 |
| 2.849424536805904 | 0 | -0.016 | 0.158 |
| 2.852566129459494 | 0 | -0.015 | 0.15 |
| 2.855707722113083 | 0 | -0.014 | 0.142 |
| 2.858849314766673 | 0 | -0.013 | 0.134 |
| 2.861990907420262 | 0 | -0.012 | 0.126 |
| 2.865132500073852 | 0 | -0.011 | 0.119 |
| 2.868274092727442 | 0 | -0.01 | 0.112 |
| 2.871415685381031 | 0 | -0.01 | 0.105 |
| 2.874557278034621 | 0 | -0.009 | 0.098 |
| 2.87769887068821 | 0 | -0.008 | 0.092 |
| 2.8808404633418 | 0 | -0.008 | 0.086 |
| 2.88398205599539 | 0 | -0.007 | 0.081 |
| 2.88712364864898 | 0 | -0.007 | 0.076 |
| 2.890265241302569 | 0 | -0.006 | 0.07 |
| 2.893406833956158 | 0 | -0.006 | 0.066 |
| 2.896548426609748 | 0 | -0.005 | 0.061 |
| 2.899690019263338 | 0 | -0.005 | 0.057 |
| 2.902831611916927 | 0 | -0.004 | 0.053 |
| 2.905973204570517 | 0 | -0.004 | 0.049 |
| 2.909114797224106 | 0 | -0.004 | 0.045 |
| 2.912256389877696 | 0 | -0.003 | 0.042 |
| 2.915397982531286 | 0 | -0.003 | 0.038 |
| 2.918539575184875 | 0 | -0.003 | 0.035 |
| 2.921681167838465 | 0 | -0.003 | 0.032 |
| 2.924822760492054 | 0 | -0.002 | 0.03 |
| 2.927964353145644 | 0 | -0.002 | 0.027 |
| 2.931105945799234 | 0 | -0.002 | 0.025 |
| 2.934247538452823 | 0 | -0.002 | 0.023 |
| 2.937389131106413 | 0 | -0.002 | 0.021 |
| 2.940530723760002 | 0 | -0.001 | 0.019 |
| 2.943672316413592 | 0 | -0.001 | 0.017 |
| 2.946813909067182 | 0 | -0.001 | 0.016 |
| 2.949955501720771 | 0 | -0.001 | 0.014 |
| 2.953097094374361 | 0 | -0.001 | 0.013 |
| 2.95623868702795 | 0 | -0.001 | 0.011 |
| 2.95938027968154 | 0 | -0.001 | 0.01 |
| 2.96252187233513 | 0 | -0.001 | 0.009 |
| 2.965663464988719 | 0 | -0.001 | 0.008 |
| 2.968805057642309 | 0 | -0.001 | 0.007 |
| 2.971946650295898 | 0 | 0 | 0.007 |
| 2.975088242949488 | 0 | 0 | 0.006 |
| 2.978229835603078 | 0 | 0 | 0.005 |
| 2.981371428256667 | 0 | 0 | 0.005 |
| 2.984513020910257 | 0 | 0 | 0.004 |
| 2.987654613563846 | 0 | 0 | 0.003 |
| 2.990796206217436 | 0 | 0 | 0.003 |
| 2.993937798871025 | 0 | 0 | 0.003 |
| 2.997079391524615 | 0 | 0 | 0.002 |
| 3.000220984178205 | 0 | 0 | 0.002 |
| 3.003362576831794 | 0 | 0 | 0.002 |
| 3.006504169485384 | 0 | 0 | 0.001 |
| 3.009645762138974 | 0 | 0 | 0.001 |
| 3.012787354792563 | 0 | 0 | 0.001 |
| 3.015928947446153 | 0 | 0 | 0.001 |
| 3.019070540099742 | 0 | 0 | 0.001 |
| 3.022212132753332 | 0 | 0 | 0.001 |
| 3.025353725406922 | 0 | 0 | 0.001 |
| 3.028495318060511 | 0 | 0 | 0 |
| 3.031636910714101 | 0 | 0 | 0 |
| 3.03477850336769 | 0 | 0 | 0 |
| 3.03792009602128 | 0 | 0 | 0 |
| 3.04106168867487 | 0 | 0 | 0 |
| 3.04420328132846 | 0 | 0 | 0 |
| 3.047344873982049 | 0 | 0 | 0 |
| 3.050486466635638 | 0 | 0 | 0 |
| 3.053628059289228 | 0 | 0 | 0 |
| 3.056769651942818 | 0 | 0 | 0 |
| 3.059911244596407 | 0 | 0 | 0 |
| 3.063052837249997 | 0 | 0 | 0 |
| 3.066194429903586 | 0 | 0 | 0 |
| 3.069336022557176 | 0 | 0 | 0 |
| 3.072477615210766 | 0 | 0 | 0 |
| 3.075619207864355 | 0 | 0 | 0 |
| 3.078760800517945 | 0 | 0 | 0 |
| 3.081902393171534 | 0 | 0 | 0 |
| 3.085043985825124 | 0 | 0 | 0 |
| 3.088185578478713 | 0 | 0 | 0 |
| 3.091327171132303 | 0 | 0 | 0 |
| 3.094468763785893 | 0 | 0 | 0 |
| 3.097610356439482 | 0 | 0 | 0 |
| 3.100751949093072 | 0 | 0 | 0 |
| 3.103893541746661 | 0 | 0 | 0 |
| 3.107035134400251 | 0 | 0 | 0 |
| 3.110176727053841 | 0 | 0 | 0 |
| 3.11331831970743 | 0 | 0 | 0 |
| 3.11645991236102 | 0 | 0 | 0 |
| 3.11960150501461 | 0 | 0 | 0 |
| 3.122743097668199 | 0 | 0 | 0 |
| 3.125884690321789 | 0 | 0 | 0 |
| 3.129026282975378 | 0 | 0 | 0 |
| 3.132167875628968 | 0 | 0 | 0 |
| 3.135309468282557 | 0 | 0 | 0 |
| 3.138451060936147 | 0 | 0 | 0 |
| 3.141592653589737 | 0 | 0 | 0 |
| 3.144734246243326 | 0 | 0 | 0 |
| 3.147875838896916 | 0 | 0 | 0 |
| 3.151017431550505 | 0 | 0 | 0 |
| 3.154159024204095 | 0 | 0 | 0 |
| 3.157300616857685 | 0 | 0 | 0 |
| 3.160442209511274 | 0 | 0 | 0 |
| 3.163583802164864 | 0 | 0 | 0 |
| 3.166725394818453 | 0 | 0 | 0 |
| 3.169866987472043 | 0 | 0 | 0 |
| 3.173008580125633 | 0 | 0 | 0 |
| 3.176150172779222 | 0 | 0 | 0 |
| 3.179291765432812 | 0 | 0 | 0 |
| 3.182433358086401 | 0 | 0 | 0 |
| 3.185574950739991 | 0 | 0 | 0 |
| 3.188716543393581 | 0 | 0 | 0 |
| 3.19185813604717 | 0 | 0 | 0 |
| 3.19499972870076 | 0 | 0 | 0 |
| 3.198141321354349 | 0 | 0 | 0 |
| 3.20128291400794 | 0 | 0 | 0 |
| 3.204424506661528 | 0 | 0 | 0 |
| 3.207566099315118 | 0 | 0 | 0 |
| 3.210707691968708 | 0 | 0 | 0 |
| 3.213849284622297 | 0 | 0 | 0 |
| 3.216990877275887 | 0 | 0 | 0 |
| 3.220132469929476 | 0 | 0 | 0 |
| 3.223274062583066 | 0 | 0 | 0 |
| 3.226415655236656 | 0 | 0 | 0 |
| 3.229557247890245 | 0 | 0 | 0 |
| 3.232698840543835 | 0 | 0 | 0 |
| 3.235840433197425 | 0 | 0 | 0 |
| 3.238982025851014 | 0 | 0 | 0 |
| 3.242123618504604 | 0 | 0 | 0 |
| 3.245265211158193 | 0 | 0 | 0 |
| 3.248406803811783 | 0 | 0 | 0 |
| 3.251548396465373 | 0 | 0 | 0 |
| 3.254689989118962 | 0 | 0 | 0 |
| 3.257831581772551 | 0 | 0 | -0.001 |
| 3.260973174426141 | 0 | 0 | -0.001 |
| 3.26411476707973 | 0 | 0 | -0.001 |
| 3.267256359733321 | 0 | 0 | -0.001 |
| 3.27039795238691 | 0 | 0 | -0.001 |
| 3.2735395450405 | 0 | 0 | -0.001 |
| 3.276681137694089 | 0 | 0 | -0.001 |
| 3.279822730347679 | 0 | 0 | -0.002 |
| 3.282964323001269 | 0 | 0 | -0.002 |
| 3.286105915654858 | 0 | 0 | -0.002 |
| 3.289247508308448 | 0 | 0 | -0.003 |
| 3.292389100962037 | 0 | 0 | -0.003 |
| 3.295530693615627 | 0 | 0 | -0.003 |
| 3.298672286269217 | 0 | 0 | -0.004 |
| 3.301813878922806 | 0 | 0 | -0.005 |
| 3.304955471576396 | 0 | 0 | -0.005 |
| 3.308097064229985 | 0 | 0 | -0.006 |
| 3.311238656883575 | 0 | 0 | -0.007 |
| 3.314380249537165 | 0 | 0.001 | -0.007 |
| 3.317521842190754 | 0 | 0.001 | -0.008 |
| 3.320663434844344 | 0 | 0.001 | -0.009 |
| 3.323805027497933 | 0 | 0.001 | -0.01 |
| 3.326946620151523 | 0 | 0.001 | -0.011 |
| 3.330088212805113 | 0 | 0.001 | -0.013 |
| 3.333229805458702 | 0 | 0.001 | -0.014 |
| 3.336371398112292 | 0 | 0.001 | -0.016 |
| 3.339512990765881 | 0 | 0.001 | -0.017 |
| 3.342654583419471 | 0 | 0.001 | -0.019 |
| 3.345796176073061 | 0 | 0.002 | -0.021 |
| 3.34893776872665 | 0 | 0.002 | -0.023 |
| 3.35207936138024 | 0 | 0.002 | -0.025 |
| 3.355220954033829 | 0 | 0.002 | -0.027 |
| 3.358362546687419 | 0 | 0.002 | -0.03 |
| 3.361504139341009 | 0 | 0.003 | -0.032 |
| 3.364645731994598 | 0 | 0.003 | -0.035 |
| 3.367787324648188 | 0 | 0.003 | -0.038 |
| 3.370928917301777 | 0 | 0.003 | -0.042 |
| 3.374070509955367 | 0 | 0.004 | -0.045 |
| 3.377212102608956 | 0 | 0.004 | -0.049 |
| 3.380353695262546 | 0 | 0.004 | -0.053 |
| 3.383495287916136 | 0 | 0.005 | -0.057 |
| 3.386636880569725 | 0 | 0.005 | -0.061 |
| 3.389778473223315 | 0 | 0.006 | -0.066 |
| 3.392920065876904 | 0 | 0.006 | -0.07 |
| 3.396061658530494 | 0 | 0.007 | -0.076 |
| 3.399203251184084 | 0 | 0.007 | -0.081 |
| 3.402344843837673 | 0 | 0.008 | -0.086 |
| 3.405486436491263 | 0 | 0.008 | -0.092 |
| 3.408628029144852 | 0 | 0.009 | -0.098 |
| 3.411769621798442 | 0 | 0.01 | -0.105 |
| 3.414911214452032 | 0 | 0.01 | -0.112 |
| 3.418052807105621 | 0 | 0.011 | -0.119 |
| 3.421194399759211 | 0 | 0.012 | -0.126 |
| 3.4243359924128 | 0 | 0.013 | -0.134 |
| 3.42747758506639 | 0 | 0.014 | -0.142 |
| 3.43061917771998 | 0 | 0.015 | -0.15 |
| 3.433760770373569 | 0 | 0.016 | -0.158 |
| 3.436902363027159 | 0 | 0.017 | -0.167 |
| 3.440043955680748 | 0 | 0.018 | -0.176 |
| 3.443185548334338 | 0 | 0.019 | -0.186 |
| 3.446327140987927 | 0 | 0.02 | -0.196 |
| 3.449468733641517 | 0 | 0.021 | -0.206 |
| 3.452610326295107 | 0 | 0.023 | -0.216 |
| 3.455751918948696 | 0 | 0.024 | -0.227 |
| 3.458893511602286 | 0 | 0.026 | -0.238 |
| 3.462035104255876 | 0 | 0.027 | -0.249 |
| 3.465176696909465 | 0 | 0.029 | -0.261 |
| 3.468318289563055 | 0 | 0.031 | -0.273 |
| 3.471459882216644 | 0 | 0.032 | -0.285 |
| 3.474601474870234 | 0 | 0.034 | -0.297 |
| 3.477743067523824 | 0 | 0.036 | -0.31 |
| 3.480884660177413 | 0 | 0.038 | -0.323 |
| 3.484026252831002 | 0 | 0.041 | -0.336 |
| 3.487167845484592 | -0.001 | 0.043 | -0.35 |
| 3.490309438138182 | -0.001 | 0.045 | -0.364 |
| 3.493451030791772 | -0.001 | 0.047 | -0.378 |
| 3.496592623445361 | -0.001 | 0.05 | -0.392 |
| 3.499734216098951 | -0.001 | 0.053 | -0.406 |
| 3.50287580875254 | -0.001 | 0.055 | -0.421 |
| 3.50601740140613 | -0.001 | 0.058 | -0.436 |
| 3.50915899405972 | -0.001 | 0.061 | -0.451 |
| 3.512300586713309 | -0.001 | 0.064 | -0.466 |
| 3.515442179366899 | -0.001 | 0.067 | -0.481 |
| 3.518583772020488 | -0.001 | 0.07 | -0.497 |
| 3.521725364674078 | -0.001 | 0.074 | -0.512 |
| 3.524866957327668 | -0.001 | 0.077 | -0.528 |
| 3.528008549981257 | -0.001 | 0.081 | -0.543 |
| 3.531150142634847 | -0.001 | 0.085 | -0.559 |
| 3.534291735288436 | -0.001 | 0.088 | -0.575 |
| 3.537433327942026 | -0.001 | 0.092 | -0.59 |
| 3.540574920595616 | -0.001 | 0.096 | -0.606 |
| 3.543716513249205 | -0.001 | 0.101 | -0.622 |
| 3.546858105902795 | -0.001 | 0.105 | -0.637 |
| 3.549999698556384 | -0.002 | 0.109 | -0.653 |
| 3.553141291209974 | -0.002 | 0.114 | -0.668 |
| 3.556282883863564 | -0.002 | 0.119 | -0.684 |
| 3.559424476517153 | -0.002 | 0.124 | -0.699 |
| 3.562566069170743 | -0.002 | 0.129 | -0.714 |
| 3.565707661824332 | -0.002 | 0.134 | -0.729 |
| 3.568849254477922 | -0.002 | 0.139 | -0.743 |
| 3.571990847131511 | -0.002 | 0.144 | -0.758 |
| 3.575132439785101 | -0.002 | 0.15 | -0.772 |
| 3.578274032438691 | -0.002 | 0.155 | -0.786 |
| 3.58141562509228 | -0.003 | 0.161 | -0.8 |
| 3.58455721774587 | -0.003 | 0.167 | -0.813 |
| 3.58769881039946 | -0.003 | 0.173 | -0.826 |
| 3.590840403053049 | -0.003 | 0.179 | -0.839 |
| 3.593981995706639 | -0.003 | 0.186 | -0.851 |
| 3.597123588360228 | -0.003 | 0.192 | -0.863 |
| 3.600265181013818 | -0.003 | 0.199 | -0.875 |
| 3.603406773667407 | -0.003 | 0.206 | -0.886 |
| 3.606548366320997 | -0.004 | 0.213 | -0.897 |
| 3.609689958974587 | -0.004 | 0.22 | -0.907 |
| 3.612831551628176 | -0.004 | 0.227 | -0.917 |
| 3.615973144281766 | -0.004 | 0.234 | -0.926 |
| 3.619114736935355 | -0.004 | 0.242 | -0.935 |
| 3.622256329588945 | -0.005 | 0.249 | -0.943 |
| 3.625397922242534 | -0.005 | 0.257 | -0.951 |
| 3.628539514896124 | -0.005 | 0.265 | -0.958 |
| 3.631681107549714 | -0.005 | 0.273 | -0.965 |
| 3.634822700203303 | -0.005 | 0.281 | -0.971 |
| 3.637964292856893 | -0.006 | 0.289 | -0.977 |
| 3.641105885510483 | -0.006 | 0.297 | -0.982 |
| 3.644247478164072 | -0.006 | 0.306 | -0.986 |
| 3.647389070817662 | -0.006 | 0.314 | -0.99 |
| 3.650530663471251 | -0.007 | 0.323 | -0.993 |
| 3.653672256124841 | -0.007 | 0.332 | -0.996 |
| 3.656813848778431 | -0.007 | 0.341 | -0.998 |
| 3.65995544143202 | -0.007 | 0.35 | -0.999 |
| 3.66309703408561 | -0.008 | 0.359 | -1 |
| 3.666238626739199 | -0.008 | 0.368 | -1 |
| 3.66938021939279 | -0.008 | 0.378 | -0.999 |
| 3.672521812046378 | -0.009 | 0.387 | -0.998 |
| 3.675663404699968 | -0.009 | 0.397 | -0.997 |
| 3.678804997353558 | -0.009 | 0.406 | -0.994 |
| 3.681946590007147 | -0.01 | 0.416 | -0.991 |
| 3.685088182660737 | -0.01 | 0.426 | -0.988 |
| 3.688229775314326 | -0.01 | 0.436 | -0.983 |
| 3.691371367967916 | -0.011 | 0.446 | -0.979 |
| 3.694512960621506 | -0.011 | 0.456 | -0.973 |
| 3.697654553275095 | -0.011 | 0.466 | -0.967 |
| 3.700796145928685 | -0.012 | 0.476 | -0.961 |
| 3.703937738582274 | -0.012 | 0.486 | -0.954 |
| 3.707079331235864 | -0.013 | 0.497 | -0.946 |
| 3.710220923889454 | -0.013 | 0.507 | -0.938 |
| 3.713362516543043 | -0.014 | 0.517 | -0.929 |
| 3.716504109196633 | -0.014 | 0.528 | -0.92 |
| 3.719645701850223 | -0.015 | 0.538 | -0.91 |
| 3.722787294503812 | -0.015 | 0.548 | -0.9 |
| 3.725928887157402 | -0.016 | 0.559 | -0.89 |
| 3.729070479810991 | -0.016 | 0.569 | -0.879 |
| 3.732212072464581 | -0.017 | 0.58 | -0.867 |
| 3.735353665118171 | -0.017 | 0.59 | -0.855 |
| 3.73849525777176 | -0.018 | 0.601 | -0.843 |
| 3.74163685042535 | -0.018 | 0.611 | -0.831 |
| 3.744778443078939 | -0.019 | 0.622 | -0.818 |
| 3.747920035732529 | -0.02 | 0.632 | -0.804 |
| 3.751061628386119 | -0.02 | 0.642 | -0.791 |
| 3.754203221039708 | -0.021 | 0.653 | -0.777 |
| 3.757344813693298 | -0.021 | 0.663 | -0.763 |
| 3.760486406346887 | -0.022 | 0.673 | -0.748 |
| 3.763627999000477 | -0.023 | 0.684 | -0.734 |
| 3.766769591654067 | -0.024 | 0.694 | -0.719 |
| 3.769911184307656 | -0.024 | 0.704 | -0.704 |
| 3.773052776961246 | -0.025 | 0.714 | -0.689 |
| 3.776194369614835 | -0.026 | 0.724 | -0.673 |
| 3.779335962268425 | -0.027 | 0.734 | -0.658 |
| 3.782477554922014 | -0.027 | 0.743 | -0.642 |
| 3.785619147575604 | -0.028 | 0.753 | -0.627 |
| 3.788760740229193 | -0.029 | 0.763 | -0.611 |
| 3.791902332882783 | -0.03 | 0.772 | -0.595 |
| 3.795043925536373 | -0.031 | 0.781 | -0.58 |
| 3.798185518189962 | -0.032 | 0.791 | -0.564 |
| 3.801327110843552 | -0.032 | 0.8 | -0.548 |
| 3.804468703497142 | -0.033 | 0.809 | -0.533 |
| 3.807610296150731 | -0.034 | 0.818 | -0.517 |
| 3.810751888804321 | -0.035 | 0.826 | -0.502 |
| 3.813893481457911 | -0.036 | 0.835 | -0.486 |
| 3.8170350741115 | -0.037 | 0.843 | -0.471 |
| 3.82017666676509 | -0.038 | 0.851 | -0.456 |
| 3.823318259418679 | -0.039 | 0.859 | -0.441 |
| 3.826459852072269 | -0.041 | 0.867 | -0.426 |
| 3.829601444725859 | -0.042 | 0.875 | -0.411 |
| 3.832743037379448 | -0.043 | 0.882 | -0.397 |
| 3.835884630033038 | -0.044 | 0.89 | -0.383 |
| 3.839026222686627 | -0.045 | 0.897 | -0.368 |
| 3.842167815340217 | -0.046 | 0.904 | -0.355 |
| 3.845309407993807 | -0.047 | 0.91 | -0.341 |
| 3.848451000647396 | -0.049 | 0.917 | -0.328 |
| 3.851592593300986 | -0.05 | 0.923 | -0.314 |
| 3.854734185954575 | -0.051 | 0.929 | -0.302 |
| 3.857875778608165 | -0.053 | 0.935 | -0.289 |
| 3.861017371261755 | -0.054 | 0.941 | -0.277 |
| 3.864158963915344 | -0.055 | 0.946 | -0.265 |
| 3.867300556568933 | -0.057 | 0.951 | -0.253 |
| 3.870442149222523 | -0.058 | 0.956 | -0.242 |
| 3.873583741876112 | -0.06 | 0.961 | -0.23 |
| 3.876725334529703 | -0.061 | 0.965 | -0.22 |
| 3.879866927183292 | -0.063 | 0.969 | -0.209 |
| 3.883008519836882 | -0.064 | 0.973 | -0.199 |
| 3.886150112490471 | -0.066 | 0.977 | -0.189 |
| 3.889291705144061 | -0.067 | 0.98 | -0.179 |
| 3.892433297797651 | -0.069 | 0.983 | -0.17 |
| 3.89557489045124 | -0.07 | 0.986 | -0.161 |
| 3.89871648310483 | -0.072 | 0.989 | -0.153 |
| 3.901858075758419 | -0.074 | 0.991 | -0.144 |
| 3.904999668412009 | -0.076 | 0.993 | -0.136 |
| 3.908141261065598 | -0.077 | 0.995 | -0.129 |
| 3.911282853719188 | -0.079 | 0.997 | -0.121 |
| 3.914424446372778 | -0.081 | 0.998 | -0.114 |
| 3.917566039026367 | -0.083 | 0.999 | -0.107 |
| 3.920707631679957 | -0.085 | 0.999 | -0.101 |
| 3.923849224333547 | -0.086 | 1 | -0.094 |
| 3.926990816987136 | -0.088 | 1 | -0.088 |
| 3.930132409640726 | -0.09 | 1 | -0.083 |
| 3.933274002294315 | -0.092 | 0.999 | -0.077 |
| 3.936415594947905 | -0.094 | 0.999 | -0.072 |
| 3.939557187601495 | -0.096 | 0.998 | -0.067 |
| 3.942698780255084 | -0.098 | 0.997 | -0.063 |
| 3.945840372908674 | -0.101 | 0.995 | -0.058 |
| 3.948981965562263 | -0.103 | 0.993 | -0.054 |
| 3.952123558215853 | -0.105 | 0.991 | -0.05 |
| 3.955265150869442 | -0.107 | 0.989 | -0.046 |
| 3.958406743523032 | -0.109 | 0.986 | -0.043 |
| 3.961548336176622 | -0.112 | 0.983 | -0.039 |
| 3.964689928830211 | -0.114 | 0.98 | -0.036 |
| 3.967831521483801 | -0.116 | 0.977 | -0.033 |
| 3.97097311413739 | -0.119 | 0.973 | -0.031 |
| 3.97411470679098 | -0.121 | 0.969 | -0.028 |
| 3.97725629944457 | -0.124 | 0.965 | -0.026 |
| 3.98039789209816 | -0.126 | 0.961 | -0.024 |
| 3.983539484751749 | -0.129 | 0.956 | -0.021 |
| 3.986681077405338 | -0.131 | 0.951 | -0.02 |
| 3.989822670058928 | -0.134 | 0.946 | -0.018 |
| 3.992964262712517 | -0.136 | 0.941 | -0.016 |
| 3.996105855366107 | -0.139 | 0.935 | -0.015 |
| 3.999247448019697 | -0.142 | 0.929 | -0.013 |
| 4.002389040673287 | -0.144 | 0.923 | -0.012 |
| 4.005530633326877 | -0.147 | 0.917 | -0.011 |
| 4.008672225980466 | -0.15 | 0.91 | -0.01 |
| 4.011813818634056 | -0.153 | 0.904 | -0.009 |
| 4.014955411287645 | -0.155 | 0.897 | -0.008 |
| 4.018097003941234 | -0.158 | 0.89 | -0.007 |
| 4.021238596594824 | -0.161 | 0.882 | -0.006 |
| 4.024380189248414 | -0.164 | 0.875 | -0.005 |
| 4.027521781902004 | -0.167 | 0.867 | -0.005 |
| 4.030663374555593 | -0.17 | 0.859 | -0.004 |
| 4.033804967209183 | -0.173 | 0.851 | -0.004 |
| 4.036946559862773 | -0.176 | 0.843 | -0.003 |
| 4.040088152516362 | -0.179 | 0.835 | -0.003 |
| 4.043229745169951 | -0.183 | 0.826 | -0.002 |
| 4.046371337823541 | -0.186 | 0.818 | -0.002 |
| 4.049512930477131 | -0.189 | 0.809 | -0.002 |
| 4.05265452313072 | -0.192 | 0.8 | -0.002 |
| 4.05579611578431 | -0.196 | 0.791 | -0.001 |
| 4.0589377084379 | -0.199 | 0.781 | -0.001 |
| 4.062079301091489 | -0.202 | 0.772 | -0.001 |
| 4.065220893745079 | -0.206 | 0.763 | -0.001 |
| 4.068362486398668 | -0.209 | 0.753 | -0.001 |
| 4.071504079052258 | -0.213 | 0.743 | -0.001 |
| 4.074645671705848 | -0.216 | 0.734 | 0 |
| 4.077787264359437 | -0.22 | 0.724 | 0 |
| 4.080928857013027 | -0.223 | 0.714 | 0 |
| 4.084070449666616 | -0.227 | 0.704 | 0 |
| 4.087212042320206 | -0.23 | 0.694 | 0 |
| 4.090353634973795 | -0.234 | 0.684 | 0 |
| 4.093495227627385 | -0.238 | 0.673 | 0 |
| 4.096636820280975 | -0.242 | 0.663 | 0 |
| 4.099778412934564 | -0.245 | 0.653 | 0 |
| 4.102920005588154 | -0.249 | 0.642 | 0 |
| 4.106061598241744 | -0.253 | 0.632 | 0 |
| 4.109203190895333 | -0.257 | 0.622 | 0 |
| 4.112344783548923 | -0.261 | 0.611 | 0 |
| 4.115486376202512 | -0.265 | 0.601 | 0 |
| 4.118627968856102 | -0.269 | 0.59 | 0 |
| 4.121769561509692 | -0.273 | 0.58 | 0 |
| 4.124911154163281 | -0.277 | 0.569 | 0 |
| 4.128052746816871 | -0.281 | 0.559 | 0 |
| 4.13119433947046 | -0.285 | 0.548 | 0 |
| 4.13433593212405 | -0.289 | 0.538 | 0 |
| 4.13747752477764 | -0.293 | 0.528 | 0 |
| 4.14061911743123 | -0.297 | 0.517 | 0 |
| 4.143760710084818 | -0.302 | 0.507 | 0 |
| 4.146902302738408 | -0.306 | 0.497 | 0 |
| 4.150043895391998 | -0.31 | 0.486 | 0 |
| 4.153185488045588 | -0.314 | 0.476 | 0 |
| 4.156327080699177 | -0.319 | 0.466 | 0 |
| 4.159468673352766 | -0.323 | 0.456 | 0 |
| 4.162610266006356 | -0.328 | 0.446 | 0 |
| 4.165751858659946 | -0.332 | 0.436 | 0 |
| 4.168893451313535 | -0.336 | 0.426 | 0 |
| 4.172035043967125 | -0.341 | 0.416 | 0 |
| 4.175176636620715 | -0.345 | 0.406 | 0 |
| 4.178318229274304 | -0.35 | 0.397 | 0 |
| 4.181459821927894 | -0.355 | 0.387 | 0 |
| 4.184601414581484 | -0.359 | 0.378 | 0 |
| 4.187743007235073 | -0.364 | 0.368 | 0 |
| 4.190884599888663 | -0.368 | 0.359 | 0 |
| 4.194026192542252 | -0.373 | 0.35 | 0 |
| 4.197167785195842 | -0.378 | 0.341 | 0 |
| 4.200309377849432 | -0.383 | 0.332 | 0 |
| 4.203450970503021 | -0.387 | 0.323 | 0 |
| 4.206592563156611 | -0.392 | 0.314 | 0 |
| 4.2097341558102 | -0.397 | 0.306 | 0 |
| 4.21287574846379 | -0.402 | 0.297 | 0 |
| 4.21601734111738 | -0.406 | 0.289 | 0 |
| 4.21915893377097 | -0.411 | 0.281 | 0 |
| 4.222300526424559 | -0.416 | 0.273 | 0 |
| 4.225442119078148 | -0.421 | 0.265 | 0 |
| 4.228583711731738 | -0.426 | 0.257 | 0 |
| 4.231725304385327 | -0.431 | 0.249 | 0 |
| 4.234866897038917 | -0.436 | 0.242 | 0 |
| 4.238008489692506 | -0.441 | 0.234 | 0 |
| 4.241150082346096 | -0.446 | 0.227 | 0 |
| 4.244291674999685 | -0.451 | 0.22 | 0 |
| 4.247433267653276 | -0.456 | 0.213 | 0 |
| 4.250574860306865 | -0.461 | 0.206 | 0 |
| 4.253716452960455 | -0.466 | 0.199 | 0 |
| 4.256858045614044 | -0.471 | 0.192 | 0 |
| 4.259999638267634 | -0.476 | 0.186 | 0 |
| 4.263141230921224 | -0.481 | 0.179 | 0 |
| 4.266282823574813 | -0.486 | 0.173 | 0 |
| 4.269424416228403 | -0.491 | 0.167 | 0 |
| 4.272566008881992 | -0.497 | 0.161 | 0 |
| 4.275707601535582 | -0.502 | 0.155 | 0 |
| 4.27884919418917 | -0.507 | 0.15 | 0 |
| 4.28199078684276 | -0.512 | 0.144 | 0 |
| 4.285132379496351 | -0.517 | 0.139 | 0 |
| 4.28827397214994 | -0.522 | 0.134 | 0 |
| 4.29141556480353 | -0.528 | 0.129 | 0 |
| 4.294557157457119 | -0.533 | 0.124 | 0 |
| 4.29769875011071 | -0.538 | 0.119 | 0 |
| 4.300840342764299 | -0.543 | 0.114 | 0 |
| 4.303981935417888 | -0.548 | 0.109 | 0.001 |
| 4.307123528071478 | -0.554 | 0.105 | 0.001 |
| 4.310265120725067 | -0.559 | 0.101 | 0.001 |
| 4.313406713378657 | -0.564 | 0.096 | 0.001 |
| 4.316548306032247 | -0.569 | 0.092 | 0.001 |
| 4.319689898685836 | -0.575 | 0.088 | 0.001 |
| 4.322831491339426 | -0.58 | 0.085 | 0.001 |
| 4.325973083993015 | -0.585 | 0.081 | 0.002 |
| 4.329114676646605 | -0.59 | 0.077 | 0.002 |
| 4.332256269300195 | -0.595 | 0.074 | 0.002 |
| 4.335397861953784 | -0.601 | 0.07 | 0.003 |
| 4.338539454607374 | -0.606 | 0.067 | 0.003 |
| 4.341681047260963 | -0.611 | 0.064 | 0.003 |
| 4.344822639914553 | -0.616 | 0.061 | 0.004 |
| 4.347964232568143 | -0.622 | 0.058 | 0.004 |
| 4.351105825221732 | -0.627 | 0.055 | 0.005 |
| 4.354247417875322 | -0.632 | 0.053 | 0.006 |
| 4.357389010528911 | -0.637 | 0.05 | 0.006 |
| 4.360530603182501 | -0.642 | 0.047 | 0.007 |
| 4.36367219583609 | -0.648 | 0.045 | 0.008 |
| 4.36681378848968 | -0.653 | 0.043 | 0.009 |
| 4.36995538114327 | -0.658 | 0.041 | 0.01 |
| 4.373096973796859 | -0.663 | 0.038 | 0.011 |
| 4.376238566450449 | -0.668 | 0.036 | 0.012 |
| 4.379380159104038 | -0.673 | 0.034 | 0.014 |
| 4.382521751757628 | -0.678 | 0.032 | 0.015 |
| 4.385663344411217 | -0.684 | 0.031 | 0.017 |
| 4.388804937064807 | -0.689 | 0.029 | 0.018 |
| 4.391946529718397 | -0.694 | 0.027 | 0.02 |
| 4.395088122371987 | -0.699 | 0.026 | 0.022 |
| 4.398229715025576 | -0.704 | 0.024 | 0.024 |
| 4.401371307679165 | -0.709 | 0.023 | 0.027 |
| 4.404512900332755 | -0.714 | 0.021 | 0.029 |
| 4.407654492986345 | -0.719 | 0.02 | 0.032 |
| 4.410796085639934 | -0.724 | 0.019 | 0.034 |
| 4.413937678293524 | -0.729 | 0.018 | 0.037 |
| 4.417079270947114 | -0.734 | 0.017 | 0.041 |
| 4.420220863600703 | -0.739 | 0.016 | 0.044 |
| 4.423362456254293 | -0.743 | 0.015 | 0.047 |
| 4.426504048907883 | -0.748 | 0.014 | 0.051 |
| 4.429645641561472 | -0.753 | 0.013 | 0.055 |
| 4.432787234215062 | -0.758 | 0.012 | 0.06 |
| 4.435928826868651 | -0.763 | 0.011 | 0.064 |
| 4.43907041952224 | -0.767 | 0.01 | 0.069 |
| 4.44221201217583 | -0.772 | 0.01 | 0.074 |
| 4.44535360482942 | -0.777 | 0.009 | 0.079 |
| 4.44849519748301 | -0.781 | 0.008 | 0.085 |
| 4.4516367901366 | -0.786 | 0.008 | 0.09 |
| 4.454778382790188 | -0.791 | 0.007 | 0.096 |
| 4.457919975443779 | -0.795 | 0.007 | 0.103 |
| 4.461061568097368 | -0.8 | 0.006 | 0.109 |
| 4.464203160750958 | -0.804 | 0.006 | 0.116 |
| 4.467344753404547 | -0.809 | 0.005 | 0.124 |
| 4.470486346058137 | -0.813 | 0.005 | 0.131 |
| 4.473627938711726 | -0.818 | 0.004 | 0.139 |
| 4.476769531365316 | -0.822 | 0.004 | 0.147 |
| 4.479911124018905 | -0.826 | 0.004 | 0.155 |
| 4.483052716672495 | -0.831 | 0.003 | 0.164 |
| 4.486194309326085 | -0.835 | 0.003 | 0.173 |
| 4.489335901979674 | -0.839 | 0.003 | 0.183 |
| 4.492477494633264 | -0.843 | 0.003 | 0.192 |
| 4.495619087286854 | -0.847 | 0.002 | 0.202 |
| 4.498760679940443 | -0.851 | 0.002 | 0.213 |
| 4.501902272594033 | -0.855 | 0.002 | 0.223 |
| 4.505043865247622 | -0.859 | 0.002 | 0.234 |
| 4.508185457901212 | -0.863 | 0.002 | 0.245 |
| 4.511327050554801 | -0.867 | 0.001 | 0.257 |
| 4.514468643208391 | -0.871 | 0.001 | 0.269 |
| 4.517610235861981 | -0.875 | 0.001 | 0.281 |
| 4.520751828515571 | -0.879 | 0.001 | 0.293 |
| 4.52389342116916 | -0.882 | 0.001 | 0.306 |
| 4.52703501382275 | -0.886 | 0.001 | 0.319 |
| 4.530176606476339 | -0.89 | 0.001 | 0.332 |
| 4.533318199129928 | -0.893 | 0.001 | 0.345 |
| 4.536459791783518 | -0.897 | 0.001 | 0.359 |
| 4.539601384437108 | -0.9 | 0.001 | 0.373 |
| 4.542742977090698 | -0.904 | 0 | 0.387 |
| 4.545884569744287 | -0.907 | 0 | 0.402 |
| 4.549026162397876 | -0.91 | 0 | 0.416 |
| 4.552167755051466 | -0.914 | 0 | 0.431 |
| 4.555309347705056 | -0.917 | 0 | 0.446 |
| 4.558450940358646 | -0.92 | 0 | 0.461 |
| 4.561592533012235 | -0.923 | 0 | 0.476 |
| 4.564734125665825 | -0.926 | 0 | 0.491 |
| 4.567875718319415 | -0.929 | 0 | 0.507 |
| 4.571017310973004 | -0.932 | 0 | 0.522 |
| 4.574158903626594 | -0.935 | 0 | 0.538 |
| 4.577300496280183 | -0.938 | 0 | 0.554 |
| 4.580442088933772 | -0.941 | 0 | 0.569 |
| 4.583583681587362 | -0.943 | 0 | 0.585 |
| 4.586725274240952 | -0.946 | 0 | 0.601 |
| 4.589866866894542 | -0.949 | 0 | 0.616 |
| 4.593008459548131 | -0.951 | 0 | 0.632 |
| 4.596150052201721 | -0.954 | 0 | 0.648 |
| 4.59929164485531 | -0.956 | 0 | 0.663 |
| 4.6024332375089 | -0.958 | 0 | 0.678 |
| 4.60557483016249 | -0.961 | 0 | 0.694 |
| 4.608716422816079 | -0.963 | 0 | 0.709 |
| 4.611858015469668 | -0.965 | 0 | 0.724 |
| 4.614999608123258 | -0.967 | 0 | 0.739 |
| 4.618141200776848 | -0.969 | 0 | 0.753 |
| 4.621282793430437 | -0.971 | 0 | 0.767 |
| 4.624424386084027 | -0.973 | 0 | 0.781 |
| 4.627565978737617 | -0.975 | 0 | 0.795 |
| 4.630707571391206 | -0.977 | 0 | 0.809 |
| 4.633849164044795 | -0.979 | 0 | 0.822 |
| 4.636990756698386 | -0.98 | 0 | 0.835 |
| 4.640132349351975 | -0.982 | 0 | 0.847 |
| 4.643273942005564 | -0.983 | 0 | 0.859 |
| 4.646415534659154 | -0.985 | 0 | 0.871 |
| 4.649557127312744 | -0.986 | 0 | 0.882 |
| 4.652698719966334 | -0.988 | 0 | 0.893 |
| 4.655840312619923 | -0.989 | 0 | 0.904 |
| 4.658981905273513 | -0.99 | 0 | 0.914 |
| 4.662123497927102 | -0.991 | 0 | 0.923 |
| 4.665265090580692 | -0.992 | 0 | 0.932 |
| 4.668406683234282 | -0.993 | 0 | 0.941 |
| 4.671548275887871 | -0.994 | 0 | 0.949 |
| 4.674689868541461 | -0.995 | 0 | 0.956 |
| 4.67783146119505 | -0.996 | 0 | 0.963 |
| 4.68097305384864 | -0.997 | 0 | 0.969 |
| 4.68411464650223 | -0.997 | 0 | 0.975 |
| 4.687256239155819 | -0.998 | 0 | 0.98 |
| 4.690397831809409 | -0.998 | 0 | 0.985 |
| 4.693539424462998 | -0.999 | 0 | 0.989 |
| 4.696681017116588 | -0.999 | 0 | 0.992 |
| 4.699822609770177 | -0.999 | 0 | 0.995 |
| 4.702964202423767 | -1 | 0 | 0.997 |
| 4.706105795077356 | -1 | 0 | 0.999 |
| 4.709247387730946 | -1 | 0 | 1 |
| 4.712388980384535 | -1 | 0 | 1 |
| 4.715530573038126 | -1 | 0 | 1 |
| 4.718672165691715 | -1 | 0 | 0.999 |
| 4.721813758345305 | -1 | 0 | 0.997 |
| 4.724955350998894 | -0.999 | 0 | 0.995 |
| 4.728096943652484 | -0.999 | 0 | 0.992 |
| 4.731238536306074 | -0.999 | 0 | 0.989 |
| 4.734380128959663 | -0.998 | 0 | 0.985 |
| 4.737521721613253 | -0.998 | 0 | 0.98 |
| 4.740663314266842 | -0.997 | 0 | 0.975 |
| 4.743804906920432 | -0.997 | 0 | 0.969 |
| 4.74694649957402 | -0.996 | 0 | 0.963 |
| 4.750088092227611 | -0.995 | 0 | 0.956 |
| 4.7532296848812 | -0.994 | 0 | 0.949 |
| 4.75637127753479 | -0.993 | 0 | 0.941 |
| 4.75951287018838 | -0.992 | 0 | 0.932 |
| 4.76265446284197 | -0.991 | 0 | 0.923 |
| 4.765796055495559 | -0.99 | 0 | 0.914 |
| 4.768937648149149 | -0.989 | 0 | 0.904 |
| 4.772079240802738 | -0.988 | 0 | 0.893 |
| 4.775220833456327 | -0.986 | 0 | 0.882 |
| 4.778362426109917 | -0.985 | 0 | 0.871 |
| 4.781504018763507 | -0.983 | 0 | 0.859 |
| 4.784645611417097 | -0.982 | 0 | 0.847 |
| 4.787787204070686 | -0.98 | 0 | 0.835 |
| 4.790928796724275 | -0.979 | 0 | 0.822 |
| 4.794070389377865 | -0.977 | 0 | 0.809 |
| 4.797211982031455 | -0.975 | 0 | 0.795 |
| 4.800353574685045 | -0.973 | 0 | 0.781 |
| 4.803495167338634 | -0.971 | 0 | 0.767 |
| 4.806636759992224 | -0.969 | 0 | 0.753 |
| 4.809778352645814 | -0.967 | 0 | 0.739 |
| 4.812919945299403 | -0.965 | 0 | 0.724 |
| 4.816061537952993 | -0.963 | 0 | 0.709 |
| 4.819203130606582 | -0.961 | 0 | 0.694 |
| 4.822344723260172 | -0.958 | 0 | 0.678 |
| 4.825486315913761 | -0.956 | 0 | 0.663 |
| 4.828627908567351 | -0.954 | 0 | 0.648 |
| 4.83176950122094 | -0.951 | 0 | 0.632 |
| 4.83491109387453 | -0.949 | 0 | 0.616 |
| 4.83805268652812 | -0.946 | 0 | 0.601 |
| 4.841194279181709 | -0.943 | 0 | 0.585 |
| 4.844335871835299 | -0.941 | 0 | 0.569 |
| 4.847477464488889 | -0.938 | 0 | 0.554 |
| 4.850619057142478 | -0.935 | 0 | 0.538 |
| 4.853760649796068 | -0.932 | 0 | 0.522 |
| 4.856902242449657 | -0.929 | 0 | 0.507 |
| 4.860043835103247 | -0.926 | 0 | 0.491 |
| 4.863185427756837 | -0.923 | 0 | 0.476 |
| 4.866327020410426 | -0.92 | 0 | 0.461 |
| 4.869468613064015 | -0.917 | 0 | 0.446 |
| 4.872610205717605 | -0.914 | 0 | 0.431 |
| 4.875751798371195 | -0.91 | 0 | 0.416 |
| 4.878893391024784 | -0.907 | 0 | 0.402 |
| 4.882034983678374 | -0.904 | 0 | 0.387 |
| 4.885176576331964 | -0.9 | -0.001 | 0.373 |
| 4.888318168985553 | -0.897 | -0.001 | 0.359 |
| 4.891459761639143 | -0.893 | -0.001 | 0.345 |
| 4.894601354292733 | -0.89 | -0.001 | 0.332 |
| 4.897742946946322 | -0.886 | -0.001 | 0.319 |
| 4.900884539599912 | -0.882 | -0.001 | 0.306 |
| 4.904026132253501 | -0.879 | -0.001 | 0.293 |
| 4.907167724907091 | -0.875 | -0.001 | 0.281 |
| 4.91030931756068 | -0.871 | -0.001 | 0.269 |
| 4.91345091021427 | -0.867 | -0.001 | 0.257 |
| 4.91659250286786 | -0.863 | -0.002 | 0.245 |
| 4.91973409552145 | -0.859 | -0.002 | 0.234 |
| 4.922875688175039 | -0.855 | -0.002 | 0.223 |
| 4.926017280828628 | -0.851 | -0.002 | 0.213 |
| 4.929158873482218 | -0.847 | -0.002 | 0.202 |
| 4.932300466135808 | -0.843 | -0.003 | 0.192 |
| 4.935442058789397 | -0.839 | -0.003 | 0.183 |
| 4.938583651442987 | -0.835 | -0.003 | 0.173 |
| 4.941725244096576 | -0.831 | -0.003 | 0.164 |
| 4.944866836750166 | -0.826 | -0.004 | 0.155 |
| 4.948008429403755 | -0.822 | -0.004 | 0.147 |
| 4.951150022057345 | -0.818 | -0.004 | 0.139 |
| 4.954291614710935 | -0.813 | -0.005 | 0.131 |
| 4.957433207364524 | -0.809 | -0.005 | 0.124 |
| 4.960574800018114 | -0.804 | -0.006 | 0.116 |
| 4.963716392671704 | -0.8 | -0.006 | 0.109 |
| 4.966857985325293 | -0.795 | -0.007 | 0.103 |
| 4.969999577978883 | -0.791 | -0.007 | 0.096 |
| 4.973141170632472 | -0.786 | -0.008 | 0.09 |
| 4.976282763286062 | -0.781 | -0.008 | 0.085 |
| 4.979424355939651 | -0.777 | -0.009 | 0.079 |
| 4.982565948593241 | -0.772 | -0.01 | 0.074 |
| 4.985707541246831 | -0.767 | -0.01 | 0.069 |
| 4.98884913390042 | -0.763 | -0.011 | 0.064 |
| 4.99199072655401 | -0.758 | -0.012 | 0.06 |
| 4.9951323192076 | -0.753 | -0.013 | 0.055 |
| 4.99827391186119 | -0.748 | -0.014 | 0.051 |
| 5.00141550451478 | -0.743 | -0.015 | 0.047 |
| 5.004557097168369 | -0.739 | -0.016 | 0.044 |
| 5.007698689821958 | -0.734 | -0.017 | 0.041 |
| 5.010840282475548 | -0.729 | -0.018 | 0.037 |
| 5.013981875129137 | -0.724 | -0.019 | 0.034 |
| 5.017123467782727 | -0.719 | -0.02 | 0.032 |
| 5.020265060436317 | -0.714 | -0.021 | 0.029 |
| 5.023406653089906 | -0.709 | -0.023 | 0.027 |
| 5.026548245743496 | -0.704 | -0.024 | 0.024 |
| 5.029689838397085 | -0.699 | -0.026 | 0.022 |
| 5.032831431050674 | -0.694 | -0.027 | 0.02 |
| 5.035973023704264 | -0.689 | -0.029 | 0.018 |
| 5.039114616357854 | -0.684 | -0.031 | 0.017 |
| 5.042256209011444 | -0.678 | -0.032 | 0.015 |
| 5.045397801665033 | -0.673 | -0.034 | 0.014 |
| 5.048539394318622 | -0.668 | -0.036 | 0.012 |
| 5.051680986972213 | -0.663 | -0.038 | 0.011 |
| 5.054822579625802 | -0.658 | -0.041 | 0.01 |
| 5.057964172279392 | -0.653 | -0.043 | 0.009 |
| 5.061105764932981 | -0.648 | -0.045 | 0.008 |
| 5.064247357586571 | -0.642 | -0.047 | 0.007 |
| 5.067388950240161 | -0.637 | -0.05 | 0.006 |
| 5.07053054289375 | -0.632 | -0.053 | 0.006 |
| 5.07367213554734 | -0.627 | -0.055 | 0.005 |
| 5.07681372820093 | -0.622 | -0.058 | 0.004 |
| 5.079955320854519 | -0.616 | -0.061 | 0.004 |
| 5.083096913508108 | -0.611 | -0.064 | 0.003 |
| 5.086238506161698 | -0.606 | -0.067 | 0.003 |
| 5.089380098815288 | -0.601 | -0.07 | 0.003 |
| 5.092521691468877 | -0.595 | -0.074 | 0.002 |
| 5.095663284122466 | -0.59 | -0.077 | 0.002 |
| 5.098804876776057 | -0.585 | -0.081 | 0.002 |
| 5.101946469429646 | -0.58 | -0.085 | 0.001 |
| 5.105088062083236 | -0.575 | -0.088 | 0.001 |
| 5.108229654736825 | -0.569 | -0.092 | 0.001 |
| 5.111371247390415 | -0.564 | -0.096 | 0.001 |
| 5.114512840044005 | -0.559 | -0.101 | 0.001 |
| 5.117654432697594 | -0.554 | -0.105 | 0.001 |
| 5.120796025351184 | -0.548 | -0.109 | 0.001 |
| 5.123937618004773 | -0.543 | -0.114 | 0 |
| 5.127079210658363 | -0.538 | -0.119 | 0 |
| 5.130220803311953 | -0.533 | -0.124 | 0 |
| 5.133362395965542 | -0.528 | -0.129 | 0 |
| 5.136503988619131 | -0.522 | -0.134 | 0 |
| 5.13964558127272 | -0.517 | -0.139 | 0 |
| 5.142787173926311 | -0.512 | -0.144 | 0 |
| 5.1459287665799 | -0.507 | -0.15 | 0 |
| 5.14907035923349 | -0.502 | -0.155 | 0 |
| 5.15221195188708 | -0.497 | -0.161 | 0 |
| 5.15535354454067 | -0.491 | -0.167 | 0 |
| 5.158495137194259 | -0.486 | -0.173 | 0 |
| 5.161636729847848 | -0.481 | -0.179 | 0 |
| 5.164778322501438 | -0.476 | -0.186 | 0 |
| 5.167919915155028 | -0.471 | -0.192 | 0 |
| 5.171061507808617 | -0.466 | -0.199 | 0 |
| 5.174203100462206 | -0.461 | -0.206 | 0 |
| 5.177344693115796 | -0.456 | -0.213 | 0 |
| 5.180486285769386 | -0.451 | -0.22 | 0 |
| 5.183627878422976 | -0.446 | -0.227 | 0 |
| 5.186769471076565 | -0.441 | -0.234 | 0 |
| 5.189911063730155 | -0.436 | -0.242 | 0 |
| 5.193052656383744 | -0.431 | -0.249 | 0 |
| 5.196194249037334 | -0.426 | -0.257 | 0 |
| 5.199335841690924 | -0.421 | -0.265 | 0 |
| 5.202477434344513 | -0.416 | -0.273 | 0 |
| 5.205619026998103 | -0.411 | -0.281 | 0 |
| 5.208760619651692 | -0.406 | -0.289 | 0 |
| 5.211902212305282 | -0.402 | -0.297 | 0 |
| 5.215043804958871 | -0.397 | -0.306 | 0 |
| 5.218185397612461 | -0.392 | -0.314 | 0 |
| 5.221326990266051 | -0.387 | -0.323 | 0 |
| 5.22446858291964 | -0.383 | -0.332 | 0 |
| 5.22761017557323 | -0.378 | -0.341 | 0 |
| 5.23075176822682 | -0.373 | -0.35 | 0 |
| 5.23389336088041 | -0.368 | -0.359 | 0 |
| 5.237034953533999 | -0.364 | -0.368 | 0 |
| 5.240176546187588 | -0.359 | -0.378 | 0 |
| 5.243318138841178 | -0.355 | -0.387 | 0 |
| 5.246459731494767 | -0.35 | -0.397 | 0 |
| 5.249601324148357 | -0.345 | -0.406 | 0 |
| 5.252742916801947 | -0.341 | -0.416 | 0 |
| 5.255884509455536 | -0.336 | -0.426 | 0 |
| 5.259026102109125 | -0.332 | -0.436 | 0 |
| 5.262167694762715 | -0.328 | -0.446 | 0 |
| 5.265309287416305 | -0.323 | -0.456 | 0 |
| 5.268450880069895 | -0.319 | -0.466 | 0 |
| 5.271592472723484 | -0.314 | -0.476 | 0 |
| 5.274734065377074 | -0.31 | -0.486 | 0 |
| 5.277875658030664 | -0.306 | -0.497 | 0 |
| 5.281017250684253 | -0.302 | -0.507 | 0 |
| 5.284158843337843 | -0.297 | -0.517 | 0 |
| 5.287300435991432 | -0.293 | -0.528 | 0 |
| 5.290442028645022 | -0.289 | -0.538 | 0 |
| 5.293583621298612 | -0.285 | -0.548 | 0 |
| 5.296725213952201 | -0.281 | -0.559 | 0 |
| 5.299866806605791 | -0.277 | -0.569 | 0 |
| 5.30300839925938 | -0.273 | -0.58 | 0 |
| 5.30614999191297 | -0.269 | -0.59 | 0 |
| 5.30929158456656 | -0.265 | -0.601 | 0 |
| 5.312433177220149 | -0.261 | -0.611 | 0 |
| 5.315574769873739 | -0.257 | -0.622 | 0 |
| 5.318716362527328 | -0.253 | -0.632 | 0 |
| 5.321857955180918 | -0.249 | -0.642 | 0 |
| 5.324999547834508 | -0.245 | -0.653 | 0 |
| 5.328141140488097 | -0.242 | -0.663 | 0 |
| 5.331282733141686 | -0.238 | -0.673 | 0 |
| 5.334424325795276 | -0.234 | -0.684 | 0 |
| 5.337565918448866 | -0.23 | -0.694 | 0 |
| 5.340707511102456 | -0.227 | -0.704 | 0 |
| 5.343849103756045 | -0.223 | -0.714 | 0 |
| 5.346990696409634 | -0.22 | -0.724 | 0 |
| 5.350132289063224 | -0.216 | -0.734 | 0 |
| 5.353273881716814 | -0.213 | -0.743 | -0.001 |
| 5.356415474370403 | -0.209 | -0.753 | -0.001 |
| 5.359557067023993 | -0.206 | -0.763 | -0.001 |
| 5.362698659677583 | -0.202 | -0.772 | -0.001 |
| 5.365840252331172 | -0.199 | -0.781 | -0.001 |
| 5.368981844984762 | -0.196 | -0.791 | -0.001 |
| 5.372123437638351 | -0.192 | -0.8 | -0.002 |
| 5.375265030291941 | -0.189 | -0.809 | -0.002 |
| 5.378406622945531 | -0.186 | -0.818 | -0.002 |
| 5.38154821559912 | -0.183 | -0.826 | -0.002 |
| 5.38468980825271 | -0.179 | -0.835 | -0.003 |
| 5.387831400906299 | -0.176 | -0.843 | -0.003 |
| 5.39097299355989 | -0.173 | -0.851 | -0.004 |
| 5.394114586213479 | -0.17 | -0.859 | -0.004 |
| 5.397256178867068 | -0.167 | -0.867 | -0.005 |
| 5.400397771520657 | -0.164 | -0.875 | -0.005 |
| 5.403539364174247 | -0.161 | -0.882 | -0.006 |
| 5.406680956827837 | -0.158 | -0.89 | -0.007 |
| 5.409822549481426 | -0.155 | -0.897 | -0.008 |
| 5.412964142135016 | -0.153 | -0.904 | -0.009 |
| 5.416105734788605 | -0.15 | -0.91 | -0.01 |
| 5.419247327442195 | -0.147 | -0.917 | -0.011 |
| 5.422388920095785 | -0.144 | -0.923 | -0.012 |
| 5.425530512749375 | -0.142 | -0.929 | -0.013 |
| 5.428672105402964 | -0.139 | -0.935 | -0.015 |
| 5.431813698056554 | -0.136 | -0.941 | -0.016 |
| 5.434955290710143 | -0.134 | -0.946 | -0.018 |
| 5.438096883363733 | -0.131 | -0.951 | -0.02 |
| 5.441238476017322 | -0.129 | -0.956 | -0.021 |
| 5.444380068670912 | -0.126 | -0.961 | -0.024 |
| 5.447521661324502 | -0.124 | -0.965 | -0.026 |
| 5.450663253978091 | -0.121 | -0.969 | -0.028 |
| 5.453804846631681 | -0.119 | -0.973 | -0.031 |
| 5.456946439285271 | -0.116 | -0.977 | -0.033 |
| 5.46008803193886 | -0.114 | -0.98 | -0.036 |
| 5.46322962459245 | -0.112 | -0.983 | -0.039 |
| 5.466371217246039 | -0.109 | -0.986 | -0.043 |
| 5.46951280989963 | -0.107 | -0.989 | -0.046 |
| 5.472654402553218 | -0.105 | -0.991 | -0.05 |
| 5.475795995206808 | -0.103 | -0.993 | -0.054 |
| 5.478937587860398 | -0.101 | -0.995 | -0.058 |
| 5.482079180513987 | -0.098 | -0.997 | -0.063 |
| 5.485220773167577 | -0.096 | -0.998 | -0.067 |
| 5.488362365821166 | -0.094 | -0.999 | -0.072 |
| 5.491503958474756 | -0.092 | -0.999 | -0.077 |
| 5.494645551128346 | -0.09 | -1 | -0.083 |
| 5.497787143781935 | -0.088 | -1 | -0.088 |
| 5.500928736435525 | -0.086 | -1 | -0.094 |
| 5.504070329089115 | -0.085 | -0.999 | -0.101 |
| 5.507211921742704 | -0.083 | -0.999 | -0.107 |
| 5.510353514396294 | -0.081 | -0.998 | -0.114 |
| 5.513495107049883 | -0.079 | -0.997 | -0.121 |
| 5.516636699703473 | -0.077 | -0.995 | -0.129 |
| 5.519778292357062 | -0.076 | -0.993 | -0.136 |
| 5.522919885010652 | -0.074 | -0.991 | -0.144 |
| 5.526061477664242 | -0.072 | -0.989 | -0.153 |
| 5.529203070317831 | -0.07 | -0.986 | -0.161 |
| 5.532344662971421 | -0.069 | -0.983 | -0.17 |
| 5.535486255625011 | -0.067 | -0.98 | -0.179 |
| 5.5386278482786 | -0.066 | -0.977 | -0.189 |
| 5.54176944093219 | -0.064 | -0.973 | -0.199 |
| 5.544911033585779 | -0.063 | -0.969 | -0.209 |
| 5.54805262623937 | -0.061 | -0.965 | -0.22 |
| 5.551194218892959 | -0.06 | -0.961 | -0.23 |
| 5.554335811546548 | -0.058 | -0.956 | -0.242 |
| 5.557477404200137 | -0.057 | -0.951 | -0.253 |
| 5.560618996853727 | -0.055 | -0.946 | -0.265 |
| 5.563760589507317 | -0.054 | -0.941 | -0.277 |
| 5.566902182160906 | -0.053 | -0.935 | -0.289 |
| 5.570043774814496 | -0.051 | -0.929 | -0.302 |
| 5.573185367468086 | -0.05 | -0.923 | -0.314 |
| 5.576326960121675 | -0.049 | -0.917 | -0.328 |
| 5.579468552775264 | -0.047 | -0.91 | -0.341 |
| 5.582610145428854 | -0.046 | -0.904 | -0.355 |
| 5.585751738082444 | -0.045 | -0.897 | -0.368 |
| 5.588893330736034 | -0.044 | -0.89 | -0.383 |
| 5.592034923389623 | -0.043 | -0.882 | -0.397 |
| 5.595176516043213 | -0.042 | -0.875 | -0.411 |
| 5.598318108696803 | -0.041 | -0.867 | -0.426 |
| 5.601459701350392 | -0.039 | -0.859 | -0.441 |
| 5.604601294003982 | -0.038 | -0.851 | -0.456 |
| 5.607742886657571 | -0.037 | -0.843 | -0.471 |
| 5.610884479311161 | -0.036 | -0.835 | -0.486 |
| 5.61402607196475 | -0.035 | -0.826 | -0.502 |
| 5.61716766461834 | -0.034 | -0.818 | -0.517 |
| 5.62030925727193 | -0.033 | -0.809 | -0.533 |
| 5.623450849925519 | -0.032 | -0.8 | -0.548 |
| 5.626592442579109 | -0.032 | -0.791 | -0.564 |
| 5.629734035232698 | -0.031 | -0.781 | -0.58 |
| 5.632875627886288 | -0.03 | -0.772 | -0.595 |
| 5.636017220539878 | -0.029 | -0.763 | -0.611 |
| 5.639158813193467 | -0.028 | -0.753 | -0.627 |
| 5.642300405847057 | -0.027 | -0.743 | -0.642 |
| 5.645441998500646 | -0.027 | -0.734 | -0.658 |
| 5.648583591154236 | -0.026 | -0.724 | -0.673 |
| 5.651725183807825 | -0.025 | -0.714 | -0.689 |
| 5.654866776461415 | -0.024 | -0.704 | -0.704 |
| 5.658008369115005 | -0.024 | -0.694 | -0.719 |
| 5.661149961768594 | -0.023 | -0.684 | -0.734 |
| 5.664291554422184 | -0.022 | -0.673 | -0.748 |
| 5.667433147075774 | -0.021 | -0.663 | -0.763 |
| 5.670574739729363 | -0.021 | -0.653 | -0.777 |
| 5.673716332382953 | -0.02 | -0.642 | -0.791 |
| 5.676857925036542 | -0.02 | -0.632 | -0.804 |
| 5.679999517690132 | -0.019 | -0.622 | -0.818 |
| 5.683141110343721 | -0.018 | -0.611 | -0.831 |
| 5.686282702997311 | -0.018 | -0.601 | -0.843 |
| 5.689424295650901 | -0.017 | -0.59 | -0.855 |
| 5.69256588830449 | -0.017 | -0.58 | -0.867 |
| 5.69570748095808 | -0.016 | -0.569 | -0.879 |
| 5.69884907361167 | -0.016 | -0.559 | -0.89 |
| 5.701990666265259 | -0.015 | -0.548 | -0.9 |
| 5.705132258918849 | -0.015 | -0.538 | -0.91 |
| 5.708273851572438 | -0.014 | -0.528 | -0.92 |
| 5.711415444226028 | -0.014 | -0.517 | -0.929 |
| 5.714557036879618 | -0.013 | -0.507 | -0.938 |
| 5.717698629533207 | -0.013 | -0.497 | -0.946 |
| 5.720840222186797 | -0.012 | -0.486 | -0.954 |
| 5.723981814840386 | -0.012 | -0.476 | -0.961 |
| 5.727123407493976 | -0.011 | -0.466 | -0.967 |
| 5.730265000147565 | -0.011 | -0.456 | -0.973 |
| 5.733406592801155 | -0.011 | -0.446 | -0.979 |
| 5.736548185454744 | -0.01 | -0.436 | -0.983 |
| 5.739689778108334 | -0.01 | -0.426 | -0.988 |
| 5.742831370761924 | -0.01 | -0.416 | -0.991 |
| 5.745972963415514 | -0.009 | -0.406 | -0.994 |
| 5.749114556069103 | -0.009 | -0.397 | -0.997 |
| 5.752256148722693 | -0.009 | -0.387 | -0.998 |
| 5.755397741376282 | -0.008 | -0.378 | -0.999 |
| 5.758539334029872 | -0.008 | -0.368 | -1 |
| 5.761680926683462 | -0.008 | -0.359 | -1 |
| 5.764822519337051 | -0.007 | -0.35 | -0.999 |
| 5.767964111990641 | -0.007 | -0.341 | -0.998 |
| 5.77110570464423 | -0.007 | -0.332 | -0.996 |
| 5.77424729729782 | -0.007 | -0.323 | -0.993 |
| 5.77738888995141 | -0.006 | -0.314 | -0.99 |
| 5.780530482605 | -0.006 | -0.306 | -0.986 |
| 5.783672075258588 | -0.006 | -0.297 | -0.982 |
| 5.786813667912178 | -0.006 | -0.289 | -0.977 |
| 5.789955260565768 | -0.005 | -0.281 | -0.971 |
| 5.793096853219358 | -0.005 | -0.273 | -0.965 |
| 5.796238445872947 | -0.005 | -0.265 | -0.958 |
| 5.799380038526537 | -0.005 | -0.257 | -0.951 |
| 5.802521631180126 | -0.005 | -0.249 | -0.943 |
| 5.805663223833715 | -0.004 | -0.242 | -0.935 |
| 5.808804816487306 | -0.004 | -0.234 | -0.926 |
| 5.811946409140895 | -0.004 | -0.227 | -0.917 |
| 5.815088001794485 | -0.004 | -0.22 | -0.907 |
| 5.818229594448074 | -0.004 | -0.213 | -0.897 |
| 5.821371187101663 | -0.003 | -0.206 | -0.886 |
| 5.824512779755254 | -0.003 | -0.199 | -0.875 |
| 5.827654372408843 | -0.003 | -0.192 | -0.863 |
| 5.830795965062433 | -0.003 | -0.186 | -0.851 |
| 5.833937557716022 | -0.003 | -0.179 | -0.839 |
| 5.837079150369612 | -0.003 | -0.173 | -0.826 |
| 5.840220743023201 | -0.003 | -0.167 | -0.813 |
| 5.843362335676791 | -0.003 | -0.161 | -0.8 |
| 5.846503928330381 | -0.002 | -0.155 | -0.786 |
| 5.84964552098397 | -0.002 | -0.15 | -0.772 |
| 5.85278711363756 | -0.002 | -0.144 | -0.758 |
| 5.85592870629115 | -0.002 | -0.139 | -0.743 |
| 5.85907029894474 | -0.002 | -0.134 | -0.729 |
| 5.862211891598329 | -0.002 | -0.129 | -0.714 |
| 5.865353484251918 | -0.002 | -0.124 | -0.699 |
| 5.868495076905508 | -0.002 | -0.119 | -0.684 |
| 5.871636669559098 | -0.002 | -0.114 | -0.668 |
| 5.874778262212687 | -0.002 | -0.109 | -0.653 |
| 5.877919854866277 | -0.001 | -0.105 | -0.637 |
| 5.881061447519866 | -0.001 | -0.101 | -0.622 |
| 5.884203040173456 | -0.001 | -0.096 | -0.606 |
| 5.887344632827046 | -0.001 | -0.092 | -0.59 |
| 5.890486225480635 | -0.001 | -0.088 | -0.575 |
| 5.893627818134224 | -0.001 | -0.085 | -0.559 |
| 5.896769410787814 | -0.001 | -0.081 | -0.543 |
| 5.899911003441404 | -0.001 | -0.077 | -0.528 |
| 5.903052596094994 | -0.001 | -0.074 | -0.512 |
| 5.906194188748583 | -0.001 | -0.07 | -0.497 |
| 5.909335781402172 | -0.001 | -0.067 | -0.481 |
| 5.912477374055762 | -0.001 | -0.064 | -0.466 |
| 5.915618966709352 | -0.001 | -0.061 | -0.451 |
| 5.918760559362942 | -0.001 | -0.058 | -0.436 |
| 5.921902152016531 | -0.001 | -0.055 | -0.421 |
| 5.92504374467012 | -0.001 | -0.053 | -0.406 |
| 5.92818533732371 | -0.001 | -0.05 | -0.392 |
| 5.9313269299773 | -0.001 | -0.047 | -0.378 |
| 5.93446852263089 | -0.001 | -0.045 | -0.364 |
| 5.93761011528448 | -0.001 | -0.043 | -0.35 |
| 5.940751707938068 | 0 | -0.041 | -0.336 |
| 5.943893300591658 | 0 | -0.038 | -0.323 |
| 5.947034893245248 | 0 | -0.036 | -0.31 |
| 5.950176485898837 | 0 | -0.034 | -0.297 |
| 5.953318078552427 | 0 | -0.032 | -0.285 |
| 5.956459671206017 | 0 | -0.031 | -0.273 |
| 5.959601263859606 | 0 | -0.029 | -0.261 |
| 5.962742856513196 | 0 | -0.027 | -0.249 |
| 5.965884449166785 | 0 | -0.026 | -0.238 |
| 5.969026041820375 | 0 | -0.024 | -0.227 |
| 5.972167634473964 | 0 | -0.023 | -0.216 |
| 5.975309227127554 | 0 | -0.021 | -0.206 |
| 5.978450819781144 | 0 | -0.02 | -0.196 |
| 5.981592412434733 | 0 | -0.019 | -0.186 |
| 5.984734005088323 | 0 | -0.018 | -0.176 |
| 5.987875597741913 | 0 | -0.017 | -0.167 |
| 5.991017190395502 | 0 | -0.016 | -0.158 |
| 5.994158783049092 | 0 | -0.015 | -0.15 |
| 5.997300375702681 | 0 | -0.014 | -0.142 |
| 6.000441968356271 | 0 | -0.013 | -0.134 |
| 6.003583561009861 | 0 | -0.012 | -0.126 |
| 6.00672515366345 | 0 | -0.011 | -0.119 |
| 6.00986674631704 | 0 | -0.01 | -0.112 |
| 6.01300833897063 | 0 | -0.01 | -0.105 |
| 6.01614993162422 | 0 | -0.009 | -0.098 |
| 6.019291524277808 | 0 | -0.008 | -0.092 |
| 6.022433116931398 | 0 | -0.008 | -0.086 |
| 6.025574709584988 | 0 | -0.007 | -0.081 |
| 6.028716302238577 | 0 | -0.007 | -0.076 |
| 6.031857894892167 | 0 | -0.006 | -0.07 |
| 6.034999487545757 | 0 | -0.006 | -0.066 |
| 6.038141080199346 | 0 | -0.005 | -0.061 |
| 6.041282672852935 | 0 | -0.005 | -0.057 |
| 6.044424265506525 | 0 | -0.004 | -0.053 |
| 6.047565858160115 | 0 | -0.004 | -0.049 |
| 6.050707450813704 | 0 | -0.004 | -0.045 |
| 6.053849043467294 | 0 | -0.003 | -0.042 |
| 6.056990636120884 | 0 | -0.003 | -0.038 |
| 6.060132228774473 | 0 | -0.003 | -0.035 |
| 6.063273821428063 | 0 | -0.003 | -0.032 |
| 6.066415414081653 | 0 | -0.002 | -0.03 |
| 6.069557006735242 | 0 | -0.002 | -0.027 |
| 6.072698599388831 | 0 | -0.002 | -0.025 |
| 6.07584019204242 | 0 | -0.002 | -0.023 |
| 6.078981784696011 | 0 | -0.002 | -0.021 |
| 6.082123377349601 | 0 | -0.001 | -0.019 |
| 6.08526497000319 | 0 | -0.001 | -0.017 |
| 6.08840656265678 | 0 | -0.001 | -0.016 |
| 6.09154815531037 | 0 | -0.001 | -0.014 |
| 6.094689747963959 | 0 | -0.001 | -0.013 |
| 6.097831340617549 | 0 | -0.001 | -0.011 |
| 6.100972933271138 | 0 | -0.001 | -0.01 |
| 6.104114525924728 | 0 | -0.001 | -0.009 |
| 6.107256118578317 | 0 | -0.001 | -0.008 |
| 6.110397711231907 | 0 | -0.001 | -0.007 |
| 6.113539303885497 | 0 | 0 | -0.007 |
| 6.116680896539086 | 0 | 0 | -0.006 |
| 6.119822489192675 | 0 | 0 | -0.005 |
| 6.122964081846265 | 0 | 0 | -0.005 |
| 6.126105674499855 | 0 | 0 | -0.004 |
| 6.129247267153445 | 0 | 0 | -0.003 |
| 6.132388859807034 | 0 | 0 | -0.003 |
| 6.135530452460624 | 0 | 0 | -0.003 |
| 6.138672045114213 | 0 | 0 | -0.002 |
| 6.141813637767803 | 0 | 0 | -0.002 |
| 6.144955230421393 | 0 | 0 | -0.002 |
| 6.148096823074982 | 0 | 0 | -0.001 |
| 6.151238415728571 | 0 | 0 | -0.001 |
| 6.154380008382161 | 0 | 0 | -0.001 |
| 6.157521601035751 | 0 | 0 | -0.001 |
| 6.16066319368934 | 0 | 0 | -0.001 |
| 6.16380478634293 | 0 | 0 | -0.001 |
| 6.16694637899652 | 0 | 0 | -0.001 |
| 6.170087971650109 | 0 | 0 | 0 |
| 6.173229564303698 | 0 | 0 | 0 |
| 6.176371156957289 | 0 | 0 | 0 |
| 6.179512749610878 | 0 | 0 | 0 |
| 6.182654342264468 | 0 | 0 | 0 |
| 6.185795934918057 | 0 | 0 | 0 |
| 6.188937527571647 | 0 | 0 | 0 |
| 6.192079120225237 | 0 | 0 | 0 |
| 6.195220712878826 | 0 | 0 | 0 |
| 6.198362305532415 | 0 | 0 | 0 |
| 6.201503898186005 | 0 | 0 | 0 |
| 6.204645490839594 | 0 | 0 | 0 |
| 6.207787083493184 | 0 | 0 | 0 |
| 6.210928676146774 | 0 | 0 | 0 |
| 6.214070268800364 | 0 | 0 | 0 |
| 6.217211861453953 | 0 | 0 | 0 |
| 6.220353454107543 | 0 | 0 | 0 |
| 6.223495046761133 | 0 | 0 | 0 |
| 6.226636639414722 | 0 | 0 | 0 |
| 6.229778232068312 | 0 | 0 | 0 |
| 6.232919824721901 | 0 | 0 | 0 |
| 6.236061417375491 | 0 | 0 | 0 |
| 6.23920301002908 | 0 | 0 | 0 |
| 6.24234460268267 | 0 | 0 | 0 |
| 6.24548619533626 | 0 | 0 | 0 |
| 6.24862778798985 | 0 | 0 | 0 |
| 6.251769380643438 | 0 | 0 | 0 |
| 6.254910973297028 | 0 | 0 | 0 |
| 6.258052565950618 | 0 | 0 | 0 |
| 6.261194158604208 | 0 | 0 | 0 |
| 6.264335751257797 | 0 | 0 | 0 |
| 6.267477343911387 | 0 | 0 | 0 |
| 6.270618936564976 | 0 | 0 | 0 |
| 6.273760529218566 | 0 | 0 | 0 |
| 6.276902121872155 | 0 | 0 | 0 |
| 6.280043714525745 | 0 | 0 | 0 |
| 6.283185307179335 | 0 | 0 | 0 |